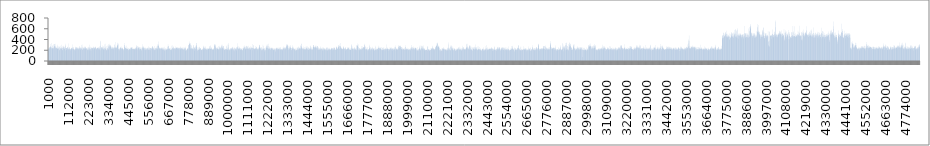
| Category | Series 0 |
|---|---|
| 1000.0 | 235.453 |
| 2000.0 | 217.351 |
| 3000.0 | 222.53 |
| 4000.0 | 208.815 |
| 5000.0 | 203.89 |
| 6000.0 | 242.891 |
| 7000.0 | 251.041 |
| 8000.0 | 257.765 |
| 9000.0 | 253.771 |
| 10000.0 | 222.914 |
| 11000.0 | 248.463 |
| 12000.0 | 273.853 |
| 13000.0 | 261.404 |
| 14000.0 | 249.856 |
| 15000.0 | 253.534 |
| 16000.0 | 316.502 |
| 17000.0 | 277.225 |
| 18000.0 | 334.291 |
| 19000.0 | 245.994 |
| 20000.0 | 260.409 |
| 21000.0 | 244.792 |
| 22000.0 | 225.853 |
| 23000.0 | 235.749 |
| 24000.0 | 282.98 |
| 25000.0 | 288.87 |
| 26000.0 | 235.765 |
| 27000.0 | 233.068 |
| 28000.0 | 240.298 |
| 29000.0 | 249.329 |
| 30000.0 | 245.887 |
| 31000.0 | 240.064 |
| 32000.0 | 222.591 |
| 33000.0 | 308.954 |
| 34000.0 | 316.191 |
| 35000.0 | 317.434 |
| 36000.0 | 312.248 |
| 37000.0 | 269.56 |
| 38000.0 | 275.898 |
| 39000.0 | 279.126 |
| 40000.0 | 322.092 |
| 41000.0 | 247.841 |
| 42000.0 | 270.132 |
| 43000.0 | 234.391 |
| 44000.0 | 255 |
| 45000.0 | 283.317 |
| 46000.0 | 244.268 |
| 47000.0 | 230.388 |
| 48000.0 | 251.718 |
| 49000.0 | 248.49 |
| 50000.0 | 241.421 |
| 51000.0 | 237.573 |
| 52000.0 | 301.914 |
| 53000.0 | 272.368 |
| 54000.0 | 223.002 |
| 55000.0 | 230.593 |
| 56000.0 | 231.656 |
| 57000.0 | 240.941 |
| 58000.0 | 229.871 |
| 59000.0 | 250.768 |
| 60000.0 | 272.821 |
| 61000.0 | 225.849 |
| 62000.0 | 269.092 |
| 63000.0 | 266.373 |
| 64000.0 | 250.383 |
| 65000.0 | 193.726 |
| 66000.0 | 203.237 |
| 67000.0 | 219.23 |
| 68000.0 | 244.583 |
| 69000.0 | 281.864 |
| 70000.0 | 242.761 |
| 71000.0 | 227.646 |
| 72000.0 | 228.386 |
| 73000.0 | 228.784 |
| 74000.0 | 254.205 |
| 75000.0 | 235.844 |
| 76000.0 | 300.545 |
| 77000.0 | 245.462 |
| 78000.0 | 222.706 |
| 79000.0 | 200.399 |
| 80000.0 | 206.49 |
| 81000.0 | 276.136 |
| 82000.0 | 239.4 |
| 83000.0 | 241.327 |
| 84000.0 | 248.958 |
| 85000.0 | 232.288 |
| 86000.0 | 254.1 |
| 87000.0 | 274.466 |
| 88000.0 | 254.657 |
| 89000.0 | 281.837 |
| 90000.0 | 231.65 |
| 91000.0 | 222.845 |
| 92000.0 | 238.022 |
| 93000.0 | 227.869 |
| 94000.0 | 258.39 |
| 95000.0 | 265.739 |
| 96000.0 | 320.007 |
| 97000.0 | 289.093 |
| 98000.0 | 282.306 |
| 99000.0 | 241.098 |
| 100000.0 | 195.601 |
| 101000.0 | 240.187 |
| 102000.0 | 228.827 |
| 103000.0 | 241.585 |
| 104000.0 | 242.284 |
| 105000.0 | 206.944 |
| 106000.0 | 243.322 |
| 107000.0 | 260.981 |
| 108000.0 | 265.699 |
| 109000.0 | 253.62 |
| 110000.0 | 240.399 |
| 111000.0 | 227.457 |
| 112000.0 | 213.309 |
| 113000.0 | 234.737 |
| 114000.0 | 213.098 |
| 115000.0 | 222.211 |
| 116000.0 | 245.713 |
| 117000.0 | 325.523 |
| 118000.0 | 261.906 |
| 119000.0 | 232.667 |
| 120000.0 | 233.776 |
| 121000.0 | 213.194 |
| 122000.0 | 254.122 |
| 123000.0 | 226.416 |
| 124000.0 | 216.545 |
| 125000.0 | 214.791 |
| 126000.0 | 194.188 |
| 127000.0 | 224.928 |
| 128000.0 | 229.505 |
| 129000.0 | 234.472 |
| 130000.0 | 244.07 |
| 131000.0 | 217.762 |
| 132000.0 | 238.69 |
| 133000.0 | 246.879 |
| 134000.0 | 236.827 |
| 135000.0 | 307.251 |
| 136000.0 | 258.978 |
| 137000.0 | 231.313 |
| 138000.0 | 234.789 |
| 139000.0 | 231.331 |
| 140000.0 | 260.905 |
| 141000.0 | 237.59 |
| 142000.0 | 222.281 |
| 143000.0 | 250.682 |
| 144000.0 | 212.742 |
| 145000.0 | 223.014 |
| 146000.0 | 224.497 |
| 147000.0 | 224.547 |
| 148000.0 | 206.563 |
| 149000.0 | 209.379 |
| 150000.0 | 199.551 |
| 151000.0 | 201.843 |
| 152000.0 | 223.871 |
| 153000.0 | 225.843 |
| 154000.0 | 250.496 |
| 155000.0 | 265.269 |
| 156000.0 | 250.664 |
| 157000.0 | 238.338 |
| 158000.0 | 261.592 |
| 159000.0 | 247.09 |
| 160000.0 | 254.499 |
| 161000.0 | 225.21 |
| 162000.0 | 250.606 |
| 163000.0 | 246.779 |
| 164000.0 | 251.504 |
| 165000.0 | 233.049 |
| 166000.0 | 228.346 |
| 167000.0 | 230.76 |
| 168000.0 | 238.335 |
| 169000.0 | 211.24 |
| 170000.0 | 228.68 |
| 171000.0 | 225.02 |
| 172000.0 | 249.262 |
| 173000.0 | 236.714 |
| 174000.0 | 229.157 |
| 175000.0 | 246.19 |
| 176000.0 | 278.343 |
| 177000.0 | 264.26 |
| 178000.0 | 235.489 |
| 179000.0 | 250.348 |
| 180000.0 | 217.307 |
| 181000.0 | 246.123 |
| 182000.0 | 239.303 |
| 183000.0 | 246.079 |
| 184000.0 | 210.015 |
| 185000.0 | 234.298 |
| 186000.0 | 252.045 |
| 187000.0 | 233.265 |
| 188000.0 | 226.039 |
| 189000.0 | 296.796 |
| 190000.0 | 309.068 |
| 191000.0 | 212.438 |
| 192000.0 | 203.067 |
| 193000.0 | 216.535 |
| 194000.0 | 248.136 |
| 195000.0 | 266.014 |
| 196000.0 | 247.428 |
| 197000.0 | 254.209 |
| 198000.0 | 223.549 |
| 199000.0 | 241.81 |
| 200000.0 | 230.371 |
| 201000.0 | 236.367 |
| 202000.0 | 257.486 |
| 203000.0 | 270.732 |
| 204000.0 | 217.448 |
| 205000.0 | 246.72 |
| 206000.0 | 231.829 |
| 207000.0 | 230.49 |
| 208000.0 | 230.772 |
| 209000.0 | 261.635 |
| 210000.0 | 270.134 |
| 211000.0 | 258.379 |
| 212000.0 | 238.624 |
| 213000.0 | 233.26 |
| 214000.0 | 226.807 |
| 215000.0 | 237.684 |
| 216000.0 | 240.857 |
| 217000.0 | 239.132 |
| 218000.0 | 236.943 |
| 219000.0 | 205.144 |
| 220000.0 | 200.427 |
| 221000.0 | 212.011 |
| 222000.0 | 249.422 |
| 223000.0 | 221.109 |
| 224000.0 | 253.863 |
| 225000.0 | 262.827 |
| 226000.0 | 243.963 |
| 227000.0 | 215.483 |
| 228000.0 | 215.87 |
| 229000.0 | 199.265 |
| 230000.0 | 234.978 |
| 231000.0 | 302.05 |
| 232000.0 | 262.575 |
| 233000.0 | 219.703 |
| 234000.0 | 237.17 |
| 235000.0 | 219.518 |
| 236000.0 | 247.626 |
| 237000.0 | 264.159 |
| 238000.0 | 221.27 |
| 239000.0 | 216.78 |
| 240000.0 | 188.529 |
| 241000.0 | 252.029 |
| 242000.0 | 232.394 |
| 243000.0 | 236.974 |
| 244000.0 | 250.407 |
| 245000.0 | 243.202 |
| 246000.0 | 235.988 |
| 247000.0 | 234.776 |
| 248000.0 | 250.89 |
| 249000.0 | 230.658 |
| 250000.0 | 240.942 |
| 251000.0 | 239.683 |
| 252000.0 | 213.704 |
| 253000.0 | 242.193 |
| 254000.0 | 252.358 |
| 255000.0 | 268.891 |
| 256000.0 | 256.751 |
| 257000.0 | 255.645 |
| 258000.0 | 248.687 |
| 259000.0 | 234.362 |
| 260000.0 | 247.65 |
| 261000.0 | 224.568 |
| 262000.0 | 239.821 |
| 263000.0 | 256.784 |
| 264000.0 | 268.901 |
| 265000.0 | 261.6 |
| 266000.0 | 254.279 |
| 267000.0 | 239.802 |
| 268000.0 | 238.03 |
| 269000.0 | 214.094 |
| 270000.0 | 237.916 |
| 271000.0 | 234.855 |
| 272000.0 | 220.56 |
| 273000.0 | 226.816 |
| 274000.0 | 240.705 |
| 275000.0 | 242.881 |
| 276000.0 | 236.616 |
| 277000.0 | 246.69 |
| 278000.0 | 241.133 |
| 279000.0 | 253.779 |
| 280000.0 | 212.048 |
| 281000.0 | 259.075 |
| 282000.0 | 227.103 |
| 283000.0 | 241.135 |
| 284000.0 | 237.76 |
| 285000.0 | 228.887 |
| 286000.0 | 256.758 |
| 287000.0 | 243.376 |
| 288000.0 | 229.673 |
| 289000.0 | 209.819 |
| 290000.0 | 280.609 |
| 291000.0 | 200.851 |
| 292000.0 | 236.074 |
| 293000.0 | 360.88 |
| 294000.0 | 374.773 |
| 295000.0 | 285.117 |
| 296000.0 | 250.018 |
| 297000.0 | 258.831 |
| 298000.0 | 215.283 |
| 299000.0 | 249.315 |
| 300000.0 | 244.003 |
| 301000.0 | 253.827 |
| 302000.0 | 289.294 |
| 303000.0 | 253.083 |
| 304000.0 | 243.57 |
| 305000.0 | 260.362 |
| 306000.0 | 221.814 |
| 307000.0 | 236.732 |
| 308000.0 | 217.783 |
| 309000.0 | 214.938 |
| 310000.0 | 217.841 |
| 311000.0 | 280.336 |
| 312000.0 | 254.199 |
| 313000.0 | 206.183 |
| 314000.0 | 243.14 |
| 315000.0 | 231.11 |
| 316000.0 | 233.556 |
| 317000.0 | 310.12 |
| 318000.0 | 271.974 |
| 319000.0 | 321.979 |
| 320000.0 | 238.097 |
| 321000.0 | 228.269 |
| 322000.0 | 225.379 |
| 323000.0 | 255.908 |
| 324000.0 | 278.368 |
| 325000.0 | 195.708 |
| 326000.0 | 214.611 |
| 327000.0 | 198.961 |
| 328000.0 | 205.024 |
| 329000.0 | 233.833 |
| 330000.0 | 289.404 |
| 331000.0 | 232.075 |
| 332000.0 | 240.764 |
| 333000.0 | 242.293 |
| 334000.0 | 214.743 |
| 335000.0 | 217.958 |
| 336000.0 | 211.774 |
| 337000.0 | 275.013 |
| 338000.0 | 257.015 |
| 339000.0 | 316.438 |
| 340000.0 | 287.124 |
| 341000.0 | 321.689 |
| 342000.0 | 288.837 |
| 343000.0 | 296.044 |
| 344000.0 | 273.574 |
| 345000.0 | 252.29 |
| 346000.0 | 254.254 |
| 347000.0 | 285.861 |
| 348000.0 | 263.115 |
| 349000.0 | 293.165 |
| 350000.0 | 279.032 |
| 351000.0 | 303.678 |
| 352000.0 | 255.698 |
| 353000.0 | 229.89 |
| 354000.0 | 225.678 |
| 355000.0 | 233.952 |
| 356000.0 | 271.41 |
| 357000.0 | 244.356 |
| 358000.0 | 260.494 |
| 359000.0 | 267.096 |
| 360000.0 | 226.675 |
| 361000.0 | 229.546 |
| 362000.0 | 243.985 |
| 363000.0 | 241.318 |
| 364000.0 | 228.532 |
| 365000.0 | 253.191 |
| 366000.0 | 255.34 |
| 367000.0 | 238.182 |
| 368000.0 | 211.713 |
| 369000.0 | 249.074 |
| 370000.0 | 249.281 |
| 371000.0 | 244.79 |
| 372000.0 | 312.607 |
| 373000.0 | 299.88 |
| 374000.0 | 253.122 |
| 375000.0 | 234.786 |
| 376000.0 | 254.46 |
| 377000.0 | 241.911 |
| 378000.0 | 271.996 |
| 379000.0 | 354.196 |
| 380000.0 | 254.656 |
| 381000.0 | 245.046 |
| 382000.0 | 239.295 |
| 383000.0 | 239.718 |
| 384000.0 | 265.282 |
| 385000.0 | 286.355 |
| 386000.0 | 340.356 |
| 387000.0 | 319.87 |
| 388000.0 | 278.834 |
| 389000.0 | 297.427 |
| 390000.0 | 294.899 |
| 391000.0 | 306.291 |
| 392000.0 | 324.827 |
| 393000.0 | 225.433 |
| 394000.0 | 215.839 |
| 395000.0 | 228.646 |
| 396000.0 | 232.201 |
| 397000.0 | 207.064 |
| 398000.0 | 231.089 |
| 399000.0 | 234.815 |
| 400000.0 | 197.539 |
| 401000.0 | 221.338 |
| 402000.0 | 248.182 |
| 403000.0 | 238.401 |
| 404000.0 | 265.056 |
| 405000.0 | 254.596 |
| 406000.0 | 248.799 |
| 407000.0 | 239.648 |
| 408000.0 | 241.981 |
| 409000.0 | 267.471 |
| 410000.0 | 218.673 |
| 411000.0 | 229.753 |
| 412000.0 | 238.315 |
| 413000.0 | 231.925 |
| 414000.0 | 233.534 |
| 415000.0 | 250.109 |
| 416000.0 | 243.917 |
| 417000.0 | 220.999 |
| 418000.0 | 238.766 |
| 419000.0 | 212.358 |
| 420000.0 | 211.386 |
| 421000.0 | 222.371 |
| 422000.0 | 224.788 |
| 423000.0 | 195.163 |
| 424000.0 | 225.618 |
| 425000.0 | 260.255 |
| 426000.0 | 334.054 |
| 427000.0 | 296.621 |
| 428000.0 | 269.499 |
| 429000.0 | 298.933 |
| 430000.0 | 240.485 |
| 431000.0 | 245.722 |
| 432000.0 | 240.094 |
| 433000.0 | 236.686 |
| 434000.0 | 267.564 |
| 435000.0 | 220.877 |
| 436000.0 | 234.651 |
| 437000.0 | 236.86 |
| 438000.0 | 281.451 |
| 439000.0 | 226.19 |
| 440000.0 | 227.444 |
| 441000.0 | 225.135 |
| 442000.0 | 249.502 |
| 443000.0 | 228.804 |
| 444000.0 | 234.4 |
| 445000.0 | 223.732 |
| 446000.0 | 212.731 |
| 447000.0 | 231.48 |
| 448000.0 | 198.997 |
| 449000.0 | 205.843 |
| 450000.0 | 212.526 |
| 451000.0 | 240.788 |
| 452000.0 | 230.979 |
| 453000.0 | 222.936 |
| 454000.0 | 212.769 |
| 455000.0 | 225.754 |
| 456000.0 | 211.386 |
| 457000.0 | 221.333 |
| 458000.0 | 210.966 |
| 459000.0 | 243.452 |
| 460000.0 | 232.461 |
| 461000.0 | 227.656 |
| 462000.0 | 256.883 |
| 463000.0 | 254.565 |
| 464000.0 | 240.47 |
| 465000.0 | 233.34 |
| 466000.0 | 258.161 |
| 467000.0 | 246.428 |
| 468000.0 | 247.854 |
| 469000.0 | 262.211 |
| 470000.0 | 238.95 |
| 471000.0 | 216.285 |
| 472000.0 | 226.522 |
| 473000.0 | 223.218 |
| 474000.0 | 225.061 |
| 475000.0 | 223.335 |
| 476000.0 | 225.393 |
| 477000.0 | 221.247 |
| 478000.0 | 242.556 |
| 479000.0 | 215.393 |
| 480000.0 | 227.591 |
| 481000.0 | 209.921 |
| 482000.0 | 221.048 |
| 483000.0 | 228.597 |
| 484000.0 | 232.757 |
| 485000.0 | 218.51 |
| 486000.0 | 214.656 |
| 487000.0 | 229.236 |
| 488000.0 | 244.017 |
| 489000.0 | 231.464 |
| 490000.0 | 251.875 |
| 491000.0 | 283.731 |
| 492000.0 | 259.191 |
| 493000.0 | 290.797 |
| 494000.0 | 247.199 |
| 495000.0 | 250.938 |
| 496000.0 | 222.141 |
| 497000.0 | 239.344 |
| 498000.0 | 279.773 |
| 499000.0 | 269.744 |
| 500000.0 | 209.923 |
| 501000.0 | 234.823 |
| 502000.0 | 268.651 |
| 503000.0 | 235.236 |
| 504000.0 | 248.888 |
| 505000.0 | 255.242 |
| 506000.0 | 251.738 |
| 507000.0 | 237.588 |
| 508000.0 | 233.634 |
| 509000.0 | 258.45 |
| 510000.0 | 230.233 |
| 511000.0 | 198.319 |
| 512000.0 | 256.727 |
| 513000.0 | 222.742 |
| 514000.0 | 216.855 |
| 515000.0 | 236.581 |
| 516000.0 | 228.103 |
| 517000.0 | 259.202 |
| 518000.0 | 223.846 |
| 519000.0 | 217.964 |
| 520000.0 | 217.252 |
| 521000.0 | 202.284 |
| 522000.0 | 197.026 |
| 523000.0 | 241.688 |
| 524000.0 | 253.796 |
| 525000.0 | 233.385 |
| 526000.0 | 239.745 |
| 527000.0 | 268.654 |
| 528000.0 | 255.123 |
| 529000.0 | 310.877 |
| 530000.0 | 254.353 |
| 531000.0 | 237.378 |
| 532000.0 | 233.153 |
| 533000.0 | 244.742 |
| 534000.0 | 276.684 |
| 535000.0 | 262.971 |
| 536000.0 | 234.094 |
| 537000.0 | 232.566 |
| 538000.0 | 244.864 |
| 539000.0 | 248.125 |
| 540000.0 | 202.566 |
| 541000.0 | 230.83 |
| 542000.0 | 201.391 |
| 543000.0 | 204.962 |
| 544000.0 | 236.738 |
| 545000.0 | 249.516 |
| 546000.0 | 226.721 |
| 547000.0 | 242.738 |
| 548000.0 | 218.111 |
| 549000.0 | 222.274 |
| 550000.0 | 237.431 |
| 551000.0 | 207.832 |
| 552000.0 | 206.09 |
| 553000.0 | 241.373 |
| 554000.0 | 229.6 |
| 555000.0 | 248.005 |
| 556000.0 | 247.852 |
| 557000.0 | 225.582 |
| 558000.0 | 276.608 |
| 559000.0 | 214.274 |
| 560000.0 | 208.659 |
| 561000.0 | 246.31 |
| 562000.0 | 209.186 |
| 563000.0 | 238.646 |
| 564000.0 | 236.599 |
| 565000.0 | 236.476 |
| 566000.0 | 261.852 |
| 567000.0 | 211.267 |
| 568000.0 | 207.147 |
| 569000.0 | 202.018 |
| 570000.0 | 236.095 |
| 571000.0 | 246.756 |
| 572000.0 | 241.423 |
| 573000.0 | 232.255 |
| 574000.0 | 243.498 |
| 575000.0 | 227.046 |
| 576000.0 | 251.177 |
| 577000.0 | 238.907 |
| 578000.0 | 227.037 |
| 579000.0 | 237.496 |
| 580000.0 | 280.955 |
| 581000.0 | 246.221 |
| 582000.0 | 264.961 |
| 583000.0 | 275.13 |
| 584000.0 | 264.075 |
| 585000.0 | 233.054 |
| 586000.0 | 235.105 |
| 587000.0 | 231.032 |
| 588000.0 | 214.612 |
| 589000.0 | 257.014 |
| 590000.0 | 231.827 |
| 591000.0 | 242.666 |
| 592000.0 | 277.436 |
| 593000.0 | 202.517 |
| 594000.0 | 224.942 |
| 595000.0 | 200.596 |
| 596000.0 | 216.098 |
| 597000.0 | 209.96 |
| 598000.0 | 214.59 |
| 599000.0 | 248.546 |
| 600000.0 | 242.332 |
| 601000.0 | 234.062 |
| 602000.0 | 234.964 |
| 603000.0 | 230.906 |
| 604000.0 | 270.643 |
| 605000.0 | 239.049 |
| 606000.0 | 245.69 |
| 607000.0 | 227.886 |
| 608000.0 | 226.78 |
| 609000.0 | 219.822 |
| 610000.0 | 236.486 |
| 611000.0 | 272.777 |
| 612000.0 | 310.776 |
| 613000.0 | 285.379 |
| 614000.0 | 281.915 |
| 615000.0 | 286.808 |
| 616000.0 | 362.546 |
| 617000.0 | 312.894 |
| 618000.0 | 277.465 |
| 619000.0 | 247.197 |
| 620000.0 | 227.265 |
| 621000.0 | 236.254 |
| 622000.0 | 255.822 |
| 623000.0 | 238.002 |
| 624000.0 | 233.028 |
| 625000.0 | 224.627 |
| 626000.0 | 236.678 |
| 627000.0 | 246.68 |
| 628000.0 | 219.155 |
| 629000.0 | 240.82 |
| 630000.0 | 226.209 |
| 631000.0 | 241.629 |
| 632000.0 | 253.95 |
| 633000.0 | 247.197 |
| 634000.0 | 235.393 |
| 635000.0 | 224.983 |
| 636000.0 | 205.655 |
| 637000.0 | 236.663 |
| 638000.0 | 229.034 |
| 639000.0 | 256.752 |
| 640000.0 | 234.113 |
| 641000.0 | 232.783 |
| 642000.0 | 231.142 |
| 643000.0 | 258.032 |
| 644000.0 | 227.855 |
| 645000.0 | 206.892 |
| 646000.0 | 211.88 |
| 647000.0 | 207.262 |
| 648000.0 | 208.799 |
| 649000.0 | 188.344 |
| 650000.0 | 266.152 |
| 651000.0 | 232.321 |
| 652000.0 | 220.649 |
| 653000.0 | 195.302 |
| 654000.0 | 217.629 |
| 655000.0 | 207.611 |
| 656000.0 | 231.269 |
| 657000.0 | 236.473 |
| 658000.0 | 219.375 |
| 659000.0 | 210.535 |
| 660000.0 | 218.863 |
| 661000.0 | 212.826 |
| 662000.0 | 235.692 |
| 663000.0 | 210.179 |
| 664000.0 | 221.793 |
| 665000.0 | 211.809 |
| 666000.0 | 226.389 |
| 667000.0 | 253.578 |
| 668000.0 | 267.732 |
| 669000.0 | 310.33 |
| 670000.0 | 276.739 |
| 671000.0 | 273.374 |
| 672000.0 | 220.982 |
| 673000.0 | 233.2 |
| 674000.0 | 281.143 |
| 675000.0 | 225.259 |
| 676000.0 | 239.631 |
| 677000.0 | 225.899 |
| 678000.0 | 237.285 |
| 679000.0 | 224.439 |
| 680000.0 | 237.665 |
| 681000.0 | 245.676 |
| 682000.0 | 215.132 |
| 683000.0 | 209.042 |
| 684000.0 | 204.436 |
| 685000.0 | 208.079 |
| 686000.0 | 199.507 |
| 687000.0 | 206.076 |
| 688000.0 | 282.659 |
| 689000.0 | 228.57 |
| 690000.0 | 224.047 |
| 691000.0 | 220.624 |
| 692000.0 | 252.093 |
| 693000.0 | 291.688 |
| 694000.0 | 237.222 |
| 695000.0 | 235.836 |
| 696000.0 | 236.574 |
| 697000.0 | 252.438 |
| 698000.0 | 269.932 |
| 699000.0 | 264.128 |
| 700000.0 | 235.872 |
| 701000.0 | 220.359 |
| 702000.0 | 231.298 |
| 703000.0 | 229.311 |
| 704000.0 | 243.461 |
| 705000.0 | 237.602 |
| 706000.0 | 230.725 |
| 707000.0 | 233.298 |
| 708000.0 | 214.178 |
| 709000.0 | 240.667 |
| 710000.0 | 232.927 |
| 711000.0 | 218.28 |
| 712000.0 | 269.843 |
| 713000.0 | 237.157 |
| 714000.0 | 246.992 |
| 715000.0 | 255.808 |
| 716000.0 | 242.956 |
| 717000.0 | 250.694 |
| 718000.0 | 240.344 |
| 719000.0 | 247.819 |
| 720000.0 | 225.274 |
| 721000.0 | 250.15 |
| 722000.0 | 240.256 |
| 723000.0 | 255.868 |
| 724000.0 | 235.505 |
| 725000.0 | 244.22 |
| 726000.0 | 225.59 |
| 727000.0 | 213.091 |
| 728000.0 | 246.995 |
| 729000.0 | 234.908 |
| 730000.0 | 247.971 |
| 731000.0 | 242.781 |
| 732000.0 | 214.275 |
| 733000.0 | 250.563 |
| 734000.0 | 233.983 |
| 735000.0 | 240.016 |
| 736000.0 | 236.221 |
| 737000.0 | 214.21 |
| 738000.0 | 268.389 |
| 739000.0 | 249.857 |
| 740000.0 | 224.354 |
| 741000.0 | 246.301 |
| 742000.0 | 229.181 |
| 743000.0 | 238.312 |
| 744000.0 | 232.053 |
| 745000.0 | 249.548 |
| 746000.0 | 244.106 |
| 747000.0 | 210.657 |
| 748000.0 | 238.913 |
| 749000.0 | 230.195 |
| 750000.0 | 253.532 |
| 751000.0 | 237.926 |
| 752000.0 | 224.361 |
| 753000.0 | 220.942 |
| 754000.0 | 204.786 |
| 755000.0 | 209.918 |
| 756000.0 | 221.796 |
| 757000.0 | 245.682 |
| 758000.0 | 256.482 |
| 759000.0 | 211.965 |
| 760000.0 | 232.018 |
| 761000.0 | 222.017 |
| 762000.0 | 250.42 |
| 763000.0 | 242.254 |
| 764000.0 | 241.118 |
| 765000.0 | 226.502 |
| 766000.0 | 264.037 |
| 767000.0 | 247.557 |
| 768000.0 | 215.652 |
| 769000.0 | 186.66 |
| 770000.0 | 203.806 |
| 771000.0 | 207.967 |
| 772000.0 | 198.534 |
| 773000.0 | 194.92 |
| 774000.0 | 217.078 |
| 775000.0 | 241.621 |
| 776000.0 | 219.797 |
| 777000.0 | 222.326 |
| 778000.0 | 243.243 |
| 779000.0 | 223.727 |
| 780000.0 | 225.759 |
| 781000.0 | 215.551 |
| 782000.0 | 290.871 |
| 783000.0 | 292.468 |
| 784000.0 | 245.285 |
| 785000.0 | 299.662 |
| 786000.0 | 320.127 |
| 787000.0 | 326.255 |
| 788000.0 | 312.965 |
| 789000.0 | 318.603 |
| 790000.0 | 330.866 |
| 791000.0 | 363.394 |
| 792000.0 | 327.652 |
| 793000.0 | 328.542 |
| 794000.0 | 298.549 |
| 795000.0 | 251.806 |
| 796000.0 | 223.326 |
| 797000.0 | 236.256 |
| 798000.0 | 289.489 |
| 799000.0 | 243.817 |
| 800000.0 | 223.362 |
| 801000.0 | 235.574 |
| 802000.0 | 289.781 |
| 803000.0 | 233.308 |
| 804000.0 | 219.323 |
| 805000.0 | 244.829 |
| 806000.0 | 248.405 |
| 807000.0 | 221.73 |
| 808000.0 | 229.983 |
| 809000.0 | 299.971 |
| 810000.0 | 293.055 |
| 811000.0 | 229.617 |
| 812000.0 | 214.443 |
| 813000.0 | 267.144 |
| 814000.0 | 251.969 |
| 815000.0 | 239.08 |
| 816000.0 | 196.779 |
| 817000.0 | 225.694 |
| 818000.0 | 256.7 |
| 819000.0 | 247.359 |
| 820000.0 | 281.684 |
| 821000.0 | 245.904 |
| 822000.0 | 224.071 |
| 823000.0 | 217.568 |
| 824000.0 | 265.633 |
| 825000.0 | 252.984 |
| 826000.0 | 269.052 |
| 827000.0 | 336.53 |
| 828000.0 | 336.714 |
| 829000.0 | 293.152 |
| 830000.0 | 291.403 |
| 831000.0 | 208.54 |
| 832000.0 | 199.875 |
| 833000.0 | 187.064 |
| 834000.0 | 223.107 |
| 835000.0 | 256.861 |
| 836000.0 | 205.213 |
| 837000.0 | 230.443 |
| 838000.0 | 254.468 |
| 839000.0 | 218.96 |
| 840000.0 | 204.058 |
| 841000.0 | 203.966 |
| 842000.0 | 251.917 |
| 843000.0 | 264.17 |
| 844000.0 | 222.392 |
| 845000.0 | 208.62 |
| 846000.0 | 251.982 |
| 847000.0 | 216.345 |
| 848000.0 | 218.289 |
| 849000.0 | 238.995 |
| 850000.0 | 243.283 |
| 851000.0 | 242.791 |
| 852000.0 | 232.157 |
| 853000.0 | 211.408 |
| 854000.0 | 200.204 |
| 855000.0 | 222.957 |
| 856000.0 | 204.481 |
| 857000.0 | 208.103 |
| 858000.0 | 202.529 |
| 859000.0 | 222.648 |
| 860000.0 | 224.71 |
| 861000.0 | 232.166 |
| 862000.0 | 211.522 |
| 863000.0 | 205.012 |
| 864000.0 | 226.187 |
| 865000.0 | 250.441 |
| 866000.0 | 214.575 |
| 867000.0 | 269.141 |
| 868000.0 | 285.768 |
| 869000.0 | 249.413 |
| 870000.0 | 255.073 |
| 871000.0 | 241.188 |
| 872000.0 | 238.344 |
| 873000.0 | 214.277 |
| 874000.0 | 233.69 |
| 875000.0 | 272.246 |
| 876000.0 | 263.7 |
| 877000.0 | 229.101 |
| 878000.0 | 217.963 |
| 879000.0 | 221.942 |
| 880000.0 | 243.134 |
| 881000.0 | 230.248 |
| 882000.0 | 212.035 |
| 883000.0 | 214.053 |
| 884000.0 | 210.811 |
| 885000.0 | 217.91 |
| 886000.0 | 235.682 |
| 887000.0 | 208.679 |
| 888000.0 | 226.239 |
| 889000.0 | 212.338 |
| 890000.0 | 228.201 |
| 891000.0 | 242.402 |
| 892000.0 | 231.274 |
| 893000.0 | 223.087 |
| 894000.0 | 226.941 |
| 895000.0 | 220.519 |
| 896000.0 | 226.686 |
| 897000.0 | 233.728 |
| 898000.0 | 277.304 |
| 899000.0 | 239.385 |
| 900000.0 | 266.266 |
| 901000.0 | 233.311 |
| 902000.0 | 229.525 |
| 903000.0 | 227.597 |
| 904000.0 | 223.682 |
| 905000.0 | 236.786 |
| 906000.0 | 223.454 |
| 907000.0 | 276.572 |
| 908000.0 | 295.157 |
| 909000.0 | 248.913 |
| 910000.0 | 218.07 |
| 911000.0 | 253.484 |
| 912000.0 | 243.141 |
| 913000.0 | 228.869 |
| 914000.0 | 224.291 |
| 915000.0 | 227.224 |
| 916000.0 | 218.833 |
| 917000.0 | 211.536 |
| 918000.0 | 208.522 |
| 919000.0 | 211.506 |
| 920000.0 | 215.803 |
| 921000.0 | 226.228 |
| 922000.0 | 212.93 |
| 923000.0 | 223.826 |
| 924000.0 | 207.952 |
| 925000.0 | 239.929 |
| 926000.0 | 286.819 |
| 927000.0 | 318.576 |
| 928000.0 | 313.848 |
| 929000.0 | 278.588 |
| 930000.0 | 297.896 |
| 931000.0 | 301.092 |
| 932000.0 | 263.594 |
| 933000.0 | 306.001 |
| 934000.0 | 284.971 |
| 935000.0 | 225.869 |
| 936000.0 | 252.713 |
| 937000.0 | 244.163 |
| 938000.0 | 251.283 |
| 939000.0 | 227.365 |
| 940000.0 | 207.4 |
| 941000.0 | 235.219 |
| 942000.0 | 235.002 |
| 943000.0 | 235.525 |
| 944000.0 | 223.993 |
| 945000.0 | 259.441 |
| 946000.0 | 231.842 |
| 947000.0 | 229.429 |
| 948000.0 | 227.54 |
| 949000.0 | 279.199 |
| 950000.0 | 225.426 |
| 951000.0 | 211.155 |
| 952000.0 | 218.12 |
| 953000.0 | 211.294 |
| 954000.0 | 224.189 |
| 955000.0 | 283.842 |
| 956000.0 | 258.566 |
| 957000.0 | 244.418 |
| 958000.0 | 250.949 |
| 959000.0 | 252.147 |
| 960000.0 | 237.313 |
| 961000.0 | 218.484 |
| 962000.0 | 238.625 |
| 963000.0 | 248.217 |
| 964000.0 | 266.749 |
| 965000.0 | 250.103 |
| 966000.0 | 228.635 |
| 967000.0 | 275.499 |
| 968000.0 | 303.85 |
| 969000.0 | 283.356 |
| 970000.0 | 280.208 |
| 971000.0 | 244.484 |
| 972000.0 | 249.136 |
| 973000.0 | 247.808 |
| 974000.0 | 228.378 |
| 975000.0 | 301.116 |
| 976000.0 | 281.215 |
| 977000.0 | 281.238 |
| 978000.0 | 223.33 |
| 979000.0 | 271.287 |
| 980000.0 | 235.113 |
| 981000.0 | 214.723 |
| 982000.0 | 215.904 |
| 983000.0 | 206.901 |
| 984000.0 | 216.019 |
| 985000.0 | 214.327 |
| 986000.0 | 241.07 |
| 987000.0 | 228.765 |
| 988000.0 | 229.121 |
| 989000.0 | 223.227 |
| 990000.0 | 213.11 |
| 991000.0 | 212.794 |
| 992000.0 | 215.352 |
| 993000.0 | 282.655 |
| 994000.0 | 216.839 |
| 995000.0 | 214.626 |
| 996000.0 | 269.928 |
| 997000.0 | 224.053 |
| 998000.0 | 212.447 |
| 999000.0 | 238.999 |
| 1000000.0 | 207.787 |
| 1001000.0 | 210.105 |
| 1002000.0 | 244.727 |
| 1003000.0 | 308.163 |
| 1004000.0 | 302.784 |
| 1005000.0 | 335.175 |
| 1006000.0 | 253.839 |
| 1007000.0 | 210.376 |
| 1008000.0 | 226.899 |
| 1009000.0 | 207.597 |
| 1010000.0 | 191.596 |
| 1011000.0 | 208.347 |
| 1012000.0 | 217.296 |
| 1013000.0 | 228.812 |
| 1014000.0 | 208.393 |
| 1015000.0 | 237.045 |
| 1016000.0 | 230.246 |
| 1017000.0 | 214.952 |
| 1018000.0 | 215.069 |
| 1019000.0 | 238.481 |
| 1020000.0 | 226.675 |
| 1021000.0 | 217.209 |
| 1022000.0 | 244.471 |
| 1023000.0 | 241.272 |
| 1024000.0 | 213.596 |
| 1025000.0 | 235.238 |
| 1026000.0 | 249.672 |
| 1027000.0 | 249.604 |
| 1028000.0 | 263.946 |
| 1029000.0 | 237.571 |
| 1030000.0 | 220.032 |
| 1031000.0 | 251.033 |
| 1032000.0 | 221.347 |
| 1033000.0 | 199.067 |
| 1034000.0 | 223.443 |
| 1035000.0 | 211.584 |
| 1036000.0 | 237.152 |
| 1037000.0 | 254.908 |
| 1038000.0 | 242.79 |
| 1039000.0 | 202.778 |
| 1040000.0 | 179.934 |
| 1041000.0 | 228.109 |
| 1042000.0 | 238.926 |
| 1043000.0 | 208.942 |
| 1044000.0 | 224.716 |
| 1045000.0 | 232.81 |
| 1046000.0 | 233.921 |
| 1047000.0 | 229.264 |
| 1048000.0 | 215.695 |
| 1049000.0 | 193.401 |
| 1050000.0 | 223.241 |
| 1051000.0 | 242.091 |
| 1052000.0 | 249.271 |
| 1053000.0 | 259.568 |
| 1054000.0 | 261.255 |
| 1055000.0 | 329.992 |
| 1056000.0 | 272.272 |
| 1057000.0 | 236.187 |
| 1058000.0 | 251.687 |
| 1059000.0 | 274.2 |
| 1060000.0 | 240.338 |
| 1061000.0 | 215.126 |
| 1062000.0 | 222.826 |
| 1063000.0 | 223.555 |
| 1064000.0 | 237.732 |
| 1065000.0 | 251.189 |
| 1066000.0 | 237.783 |
| 1067000.0 | 239.113 |
| 1068000.0 | 263.347 |
| 1069000.0 | 227.008 |
| 1070000.0 | 226.746 |
| 1071000.0 | 236.438 |
| 1072000.0 | 239.741 |
| 1073000.0 | 207.099 |
| 1074000.0 | 203.689 |
| 1075000.0 | 218.266 |
| 1076000.0 | 228.766 |
| 1077000.0 | 218.514 |
| 1078000.0 | 212.624 |
| 1079000.0 | 210.573 |
| 1080000.0 | 236.244 |
| 1081000.0 | 220.475 |
| 1082000.0 | 210.093 |
| 1083000.0 | 208.105 |
| 1084000.0 | 201.767 |
| 1085000.0 | 239.93 |
| 1086000.0 | 193.444 |
| 1087000.0 | 230.448 |
| 1088000.0 | 233.156 |
| 1089000.0 | 227.162 |
| 1090000.0 | 238.084 |
| 1091000.0 | 245.307 |
| 1092000.0 | 270.741 |
| 1093000.0 | 235.687 |
| 1094000.0 | 253.367 |
| 1095000.0 | 259.227 |
| 1096000.0 | 289.632 |
| 1097000.0 | 265.654 |
| 1098000.0 | 218.039 |
| 1099000.0 | 271.808 |
| 1100000.0 | 246.032 |
| 1101000.0 | 247.773 |
| 1102000.0 | 224.549 |
| 1103000.0 | 220.23 |
| 1104000.0 | 229.6 |
| 1105000.0 | 269.541 |
| 1106000.0 | 284.131 |
| 1107000.0 | 280.154 |
| 1108000.0 | 231.371 |
| 1109000.0 | 266.423 |
| 1110000.0 | 280.097 |
| 1111000.0 | 231.804 |
| 1112000.0 | 223.492 |
| 1113000.0 | 245.533 |
| 1114000.0 | 258.676 |
| 1115000.0 | 285.636 |
| 1116000.0 | 212.668 |
| 1117000.0 | 237.033 |
| 1118000.0 | 235.856 |
| 1119000.0 | 225.825 |
| 1120000.0 | 234.039 |
| 1121000.0 | 215.552 |
| 1122000.0 | 246.988 |
| 1123000.0 | 256.004 |
| 1124000.0 | 238.608 |
| 1125000.0 | 247.017 |
| 1126000.0 | 248.664 |
| 1127000.0 | 215.902 |
| 1128000.0 | 219.136 |
| 1129000.0 | 212.5 |
| 1130000.0 | 242.033 |
| 1131000.0 | 274.674 |
| 1132000.0 | 248.08 |
| 1133000.0 | 248.735 |
| 1134000.0 | 246.04 |
| 1135000.0 | 233.196 |
| 1136000.0 | 266.977 |
| 1137000.0 | 247.443 |
| 1138000.0 | 199.908 |
| 1139000.0 | 241.413 |
| 1140000.0 | 245.597 |
| 1141000.0 | 315.407 |
| 1142000.0 | 235.598 |
| 1143000.0 | 297.567 |
| 1144000.0 | 289.297 |
| 1145000.0 | 235.202 |
| 1146000.0 | 223.542 |
| 1147000.0 | 242.658 |
| 1148000.0 | 234.031 |
| 1149000.0 | 229.968 |
| 1150000.0 | 214.764 |
| 1151000.0 | 224.2 |
| 1152000.0 | 227.959 |
| 1153000.0 | 232.816 |
| 1154000.0 | 235.951 |
| 1155000.0 | 219.262 |
| 1156000.0 | 233.078 |
| 1157000.0 | 239.306 |
| 1158000.0 | 279.34 |
| 1159000.0 | 237.644 |
| 1160000.0 | 225.043 |
| 1161000.0 | 266.116 |
| 1162000.0 | 244.794 |
| 1163000.0 | 259.593 |
| 1164000.0 | 251.455 |
| 1165000.0 | 227.925 |
| 1166000.0 | 232.534 |
| 1167000.0 | 223.616 |
| 1168000.0 | 201.694 |
| 1169000.0 | 230.707 |
| 1170000.0 | 217.685 |
| 1171000.0 | 234.281 |
| 1172000.0 | 208.674 |
| 1173000.0 | 225.809 |
| 1174000.0 | 228.148 |
| 1175000.0 | 249.761 |
| 1176000.0 | 275.086 |
| 1177000.0 | 299.721 |
| 1178000.0 | 303.435 |
| 1179000.0 | 261.088 |
| 1180000.0 | 243.753 |
| 1181000.0 | 291.227 |
| 1182000.0 | 238.173 |
| 1183000.0 | 242.989 |
| 1184000.0 | 226.235 |
| 1185000.0 | 261.846 |
| 1186000.0 | 232.592 |
| 1187000.0 | 214.113 |
| 1188000.0 | 250.296 |
| 1189000.0 | 260.336 |
| 1190000.0 | 197.898 |
| 1191000.0 | 202.294 |
| 1192000.0 | 230.67 |
| 1193000.0 | 217.938 |
| 1194000.0 | 200.446 |
| 1195000.0 | 229.297 |
| 1196000.0 | 209.631 |
| 1197000.0 | 238.545 |
| 1198000.0 | 302.269 |
| 1199000.0 | 279.232 |
| 1200000.0 | 238.606 |
| 1201000.0 | 225.111 |
| 1202000.0 | 220.385 |
| 1203000.0 | 230.924 |
| 1204000.0 | 210.058 |
| 1205000.0 | 218.343 |
| 1206000.0 | 241.208 |
| 1207000.0 | 239.272 |
| 1208000.0 | 201.374 |
| 1209000.0 | 178.904 |
| 1210000.0 | 197.894 |
| 1211000.0 | 208.496 |
| 1212000.0 | 228.96 |
| 1213000.0 | 199.204 |
| 1214000.0 | 251.237 |
| 1215000.0 | 247.795 |
| 1216000.0 | 241.84 |
| 1217000.0 | 274.583 |
| 1218000.0 | 256.249 |
| 1219000.0 | 279.341 |
| 1220000.0 | 303.695 |
| 1221000.0 | 289.212 |
| 1222000.0 | 313.307 |
| 1223000.0 | 248.301 |
| 1224000.0 | 243.314 |
| 1225000.0 | 275.131 |
| 1226000.0 | 212.538 |
| 1227000.0 | 229.836 |
| 1228000.0 | 227.913 |
| 1229000.0 | 235.121 |
| 1230000.0 | 278.76 |
| 1231000.0 | 321.842 |
| 1232000.0 | 263.421 |
| 1233000.0 | 239.845 |
| 1234000.0 | 221.888 |
| 1235000.0 | 224.587 |
| 1236000.0 | 238.713 |
| 1237000.0 | 265.854 |
| 1238000.0 | 232.721 |
| 1239000.0 | 210.512 |
| 1240000.0 | 209.402 |
| 1241000.0 | 242.232 |
| 1242000.0 | 230.252 |
| 1243000.0 | 232.534 |
| 1244000.0 | 238.078 |
| 1245000.0 | 227.373 |
| 1246000.0 | 236.39 |
| 1247000.0 | 248.812 |
| 1248000.0 | 252.205 |
| 1249000.0 | 237.939 |
| 1250000.0 | 239.47 |
| 1251000.0 | 245.081 |
| 1252000.0 | 216.951 |
| 1253000.0 | 217.026 |
| 1254000.0 | 207.84 |
| 1255000.0 | 204.062 |
| 1256000.0 | 214.883 |
| 1257000.0 | 201.73 |
| 1258000.0 | 230.257 |
| 1259000.0 | 231.705 |
| 1260000.0 | 235.336 |
| 1261000.0 | 230.278 |
| 1262000.0 | 216.108 |
| 1263000.0 | 220.395 |
| 1264000.0 | 209.802 |
| 1265000.0 | 200.645 |
| 1266000.0 | 221.16 |
| 1267000.0 | 240.774 |
| 1268000.0 | 222.426 |
| 1269000.0 | 197.754 |
| 1270000.0 | 173.944 |
| 1271000.0 | 224.684 |
| 1272000.0 | 236.339 |
| 1273000.0 | 237.978 |
| 1274000.0 | 242.218 |
| 1275000.0 | 235.642 |
| 1276000.0 | 258.173 |
| 1277000.0 | 238.17 |
| 1278000.0 | 221.073 |
| 1279000.0 | 204.86 |
| 1280000.0 | 227.584 |
| 1281000.0 | 239.907 |
| 1282000.0 | 230.597 |
| 1283000.0 | 225.437 |
| 1284000.0 | 222.485 |
| 1285000.0 | 209.103 |
| 1286000.0 | 227.043 |
| 1287000.0 | 252.325 |
| 1288000.0 | 221.296 |
| 1289000.0 | 236.029 |
| 1290000.0 | 239.395 |
| 1291000.0 | 256.802 |
| 1292000.0 | 211.126 |
| 1293000.0 | 211.031 |
| 1294000.0 | 229.289 |
| 1295000.0 | 249.192 |
| 1296000.0 | 206.92 |
| 1297000.0 | 223.844 |
| 1298000.0 | 257.967 |
| 1299000.0 | 229.399 |
| 1300000.0 | 212.879 |
| 1301000.0 | 220.937 |
| 1302000.0 | 206.509 |
| 1303000.0 | 224.587 |
| 1304000.0 | 203.46 |
| 1305000.0 | 201.245 |
| 1306000.0 | 222.078 |
| 1307000.0 | 216.793 |
| 1308000.0 | 218.138 |
| 1309000.0 | 247.627 |
| 1310000.0 | 251.345 |
| 1311000.0 | 271.692 |
| 1312000.0 | 239.202 |
| 1313000.0 | 234.64 |
| 1314000.0 | 238.394 |
| 1315000.0 | 222.33 |
| 1316000.0 | 252.734 |
| 1317000.0 | 213.254 |
| 1318000.0 | 232.465 |
| 1319000.0 | 242.021 |
| 1320000.0 | 255.296 |
| 1321000.0 | 235.484 |
| 1322000.0 | 232.841 |
| 1323000.0 | 233.119 |
| 1324000.0 | 217.443 |
| 1325000.0 | 259 |
| 1326000.0 | 247.441 |
| 1327000.0 | 299.129 |
| 1328000.0 | 315.259 |
| 1329000.0 | 270.243 |
| 1330000.0 | 284.542 |
| 1331000.0 | 268.637 |
| 1332000.0 | 305.555 |
| 1333000.0 | 284.641 |
| 1334000.0 | 296.251 |
| 1335000.0 | 306.365 |
| 1336000.0 | 285.449 |
| 1337000.0 | 252.896 |
| 1338000.0 | 246.851 |
| 1339000.0 | 285.915 |
| 1340000.0 | 242.199 |
| 1341000.0 | 216.396 |
| 1342000.0 | 209.004 |
| 1343000.0 | 223.187 |
| 1344000.0 | 219.997 |
| 1345000.0 | 240.549 |
| 1346000.0 | 249.441 |
| 1347000.0 | 254.275 |
| 1348000.0 | 284.901 |
| 1349000.0 | 272.97 |
| 1350000.0 | 296.232 |
| 1351000.0 | 244.715 |
| 1352000.0 | 255.067 |
| 1353000.0 | 249.797 |
| 1354000.0 | 241.077 |
| 1355000.0 | 241.669 |
| 1356000.0 | 205.426 |
| 1357000.0 | 198.331 |
| 1358000.0 | 218.476 |
| 1359000.0 | 242.924 |
| 1360000.0 | 292.668 |
| 1361000.0 | 254.028 |
| 1362000.0 | 234.985 |
| 1363000.0 | 236.05 |
| 1364000.0 | 223.003 |
| 1365000.0 | 263.012 |
| 1366000.0 | 243.983 |
| 1367000.0 | 225.212 |
| 1368000.0 | 219.704 |
| 1369000.0 | 264.857 |
| 1370000.0 | 241.749 |
| 1371000.0 | 219.897 |
| 1372000.0 | 216.303 |
| 1373000.0 | 227.112 |
| 1374000.0 | 210.744 |
| 1375000.0 | 231.278 |
| 1376000.0 | 220.606 |
| 1377000.0 | 189.057 |
| 1378000.0 | 219.941 |
| 1379000.0 | 193.211 |
| 1380000.0 | 207.75 |
| 1381000.0 | 237.276 |
| 1382000.0 | 245.649 |
| 1383000.0 | 212.147 |
| 1384000.0 | 205.781 |
| 1385000.0 | 194.824 |
| 1386000.0 | 213.822 |
| 1387000.0 | 204.863 |
| 1388000.0 | 212.108 |
| 1389000.0 | 246.919 |
| 1390000.0 | 209.658 |
| 1391000.0 | 239.448 |
| 1392000.0 | 252.573 |
| 1393000.0 | 247.878 |
| 1394000.0 | 230.09 |
| 1395000.0 | 271.816 |
| 1396000.0 | 254.79 |
| 1397000.0 | 209.882 |
| 1398000.0 | 218.654 |
| 1399000.0 | 239.534 |
| 1400000.0 | 232.773 |
| 1401000.0 | 223.937 |
| 1402000.0 | 253.08 |
| 1403000.0 | 235.84 |
| 1404000.0 | 245.62 |
| 1405000.0 | 226.569 |
| 1406000.0 | 217.042 |
| 1407000.0 | 282.316 |
| 1408000.0 | 243.631 |
| 1409000.0 | 289.62 |
| 1410000.0 | 271.661 |
| 1411000.0 | 323.093 |
| 1412000.0 | 318.807 |
| 1413000.0 | 252.551 |
| 1414000.0 | 239.148 |
| 1415000.0 | 273.095 |
| 1416000.0 | 247.224 |
| 1417000.0 | 223.596 |
| 1418000.0 | 218.059 |
| 1419000.0 | 246.922 |
| 1420000.0 | 231.747 |
| 1421000.0 | 223.201 |
| 1422000.0 | 209.404 |
| 1423000.0 | 270.096 |
| 1424000.0 | 231.397 |
| 1425000.0 | 226.164 |
| 1426000.0 | 242.408 |
| 1427000.0 | 229.527 |
| 1428000.0 | 261.834 |
| 1429000.0 | 227.253 |
| 1430000.0 | 210.356 |
| 1431000.0 | 218.225 |
| 1432000.0 | 219.913 |
| 1433000.0 | 224.218 |
| 1434000.0 | 208.563 |
| 1435000.0 | 212.657 |
| 1436000.0 | 233.655 |
| 1437000.0 | 266.836 |
| 1438000.0 | 239.827 |
| 1439000.0 | 233.856 |
| 1440000.0 | 251.679 |
| 1441000.0 | 229.093 |
| 1442000.0 | 249.694 |
| 1443000.0 | 277.911 |
| 1444000.0 | 245.162 |
| 1445000.0 | 269.243 |
| 1446000.0 | 218.046 |
| 1447000.0 | 228.28 |
| 1448000.0 | 212.312 |
| 1449000.0 | 215.861 |
| 1450000.0 | 207.171 |
| 1451000.0 | 242.38 |
| 1452000.0 | 255.861 |
| 1453000.0 | 250.354 |
| 1454000.0 | 204.344 |
| 1455000.0 | 238.739 |
| 1456000.0 | 233.943 |
| 1457000.0 | 215.556 |
| 1458000.0 | 225.73 |
| 1459000.0 | 225.071 |
| 1460000.0 | 282.411 |
| 1461000.0 | 219.988 |
| 1462000.0 | 246.607 |
| 1463000.0 | 219.285 |
| 1464000.0 | 251.166 |
| 1465000.0 | 284.092 |
| 1466000.0 | 254.396 |
| 1467000.0 | 248.57 |
| 1468000.0 | 205.246 |
| 1469000.0 | 218.36 |
| 1470000.0 | 216.941 |
| 1471000.0 | 220.13 |
| 1472000.0 | 225.615 |
| 1473000.0 | 213.708 |
| 1474000.0 | 208.997 |
| 1475000.0 | 213.001 |
| 1476000.0 | 250.287 |
| 1477000.0 | 291.88 |
| 1478000.0 | 260.751 |
| 1479000.0 | 263.778 |
| 1480000.0 | 299.164 |
| 1481000.0 | 297.569 |
| 1482000.0 | 263.044 |
| 1483000.0 | 255.176 |
| 1484000.0 | 270.472 |
| 1485000.0 | 246.121 |
| 1486000.0 | 237.214 |
| 1487000.0 | 261.924 |
| 1488000.0 | 260.961 |
| 1489000.0 | 246.994 |
| 1490000.0 | 272.509 |
| 1491000.0 | 290.677 |
| 1492000.0 | 270.565 |
| 1493000.0 | 251.087 |
| 1494000.0 | 283.808 |
| 1495000.0 | 248.418 |
| 1496000.0 | 250.736 |
| 1497000.0 | 234.735 |
| 1498000.0 | 256.634 |
| 1499000.0 | 263.994 |
| 1500000.0 | 275.797 |
| 1501000.0 | 280.359 |
| 1502000.0 | 279.313 |
| 1503000.0 | 214.134 |
| 1504000.0 | 242.656 |
| 1505000.0 | 244.543 |
| 1506000.0 | 255.952 |
| 1507000.0 | 206.542 |
| 1508000.0 | 212.7 |
| 1509000.0 | 227.803 |
| 1510000.0 | 231.142 |
| 1511000.0 | 218.581 |
| 1512000.0 | 239.227 |
| 1513000.0 | 215.426 |
| 1514000.0 | 205.205 |
| 1515000.0 | 230.298 |
| 1516000.0 | 220.261 |
| 1517000.0 | 216.547 |
| 1518000.0 | 213.645 |
| 1519000.0 | 241.354 |
| 1520000.0 | 271.887 |
| 1521000.0 | 250.583 |
| 1522000.0 | 215.376 |
| 1523000.0 | 234.383 |
| 1524000.0 | 227.238 |
| 1525000.0 | 238.931 |
| 1526000.0 | 226.006 |
| 1527000.0 | 228.237 |
| 1528000.0 | 234.299 |
| 1529000.0 | 258 |
| 1530000.0 | 208.437 |
| 1531000.0 | 211.693 |
| 1532000.0 | 192.898 |
| 1533000.0 | 199.792 |
| 1534000.0 | 216.495 |
| 1535000.0 | 235.824 |
| 1536000.0 | 257.45 |
| 1537000.0 | 239.192 |
| 1538000.0 | 219.76 |
| 1539000.0 | 238.007 |
| 1540000.0 | 211.427 |
| 1541000.0 | 229.356 |
| 1542000.0 | 212.768 |
| 1543000.0 | 235.233 |
| 1544000.0 | 214.794 |
| 1545000.0 | 212.169 |
| 1546000.0 | 220.721 |
| 1547000.0 | 210.161 |
| 1548000.0 | 231.624 |
| 1549000.0 | 197.083 |
| 1550000.0 | 237.952 |
| 1551000.0 | 259.192 |
| 1552000.0 | 243.392 |
| 1553000.0 | 233.528 |
| 1554000.0 | 203.201 |
| 1555000.0 | 199.431 |
| 1556000.0 | 249.885 |
| 1557000.0 | 197.579 |
| 1558000.0 | 211.355 |
| 1559000.0 | 234.058 |
| 1560000.0 | 250.458 |
| 1561000.0 | 224.113 |
| 1562000.0 | 216.599 |
| 1563000.0 | 244.16 |
| 1564000.0 | 215.425 |
| 1565000.0 | 206.28 |
| 1566000.0 | 222.271 |
| 1567000.0 | 247.135 |
| 1568000.0 | 199.354 |
| 1569000.0 | 215.409 |
| 1570000.0 | 220.424 |
| 1571000.0 | 230.91 |
| 1572000.0 | 228.502 |
| 1573000.0 | 219.105 |
| 1574000.0 | 204.219 |
| 1575000.0 | 213.635 |
| 1576000.0 | 209.754 |
| 1577000.0 | 225.188 |
| 1578000.0 | 234.555 |
| 1579000.0 | 216.938 |
| 1580000.0 | 240.237 |
| 1581000.0 | 245.489 |
| 1582000.0 | 236.547 |
| 1583000.0 | 243.851 |
| 1584000.0 | 233.932 |
| 1585000.0 | 243.237 |
| 1586000.0 | 222.09 |
| 1587000.0 | 200.634 |
| 1588000.0 | 211.402 |
| 1589000.0 | 230.603 |
| 1590000.0 | 234.324 |
| 1591000.0 | 204.601 |
| 1592000.0 | 234.588 |
| 1593000.0 | 257.193 |
| 1594000.0 | 249.564 |
| 1595000.0 | 250.189 |
| 1596000.0 | 238.281 |
| 1597000.0 | 209.757 |
| 1598000.0 | 241.217 |
| 1599000.0 | 235.041 |
| 1600000.0 | 213.261 |
| 1601000.0 | 214.422 |
| 1602000.0 | 207.924 |
| 1603000.0 | 202.947 |
| 1604000.0 | 215.078 |
| 1605000.0 | 257.817 |
| 1606000.0 | 257.858 |
| 1607000.0 | 274.307 |
| 1608000.0 | 262.042 |
| 1609000.0 | 215.871 |
| 1610000.0 | 240.181 |
| 1611000.0 | 221.038 |
| 1612000.0 | 228.572 |
| 1613000.0 | 242.125 |
| 1614000.0 | 221.504 |
| 1615000.0 | 249.751 |
| 1616000.0 | 297.292 |
| 1617000.0 | 263.117 |
| 1618000.0 | 250.721 |
| 1619000.0 | 254.406 |
| 1620000.0 | 272.981 |
| 1621000.0 | 293.045 |
| 1622000.0 | 280.626 |
| 1623000.0 | 227.485 |
| 1624000.0 | 226.9 |
| 1625000.0 | 279.608 |
| 1626000.0 | 305.337 |
| 1627000.0 | 266.367 |
| 1628000.0 | 273.25 |
| 1629000.0 | 275.83 |
| 1630000.0 | 239.673 |
| 1631000.0 | 269.415 |
| 1632000.0 | 334.247 |
| 1633000.0 | 235.721 |
| 1634000.0 | 240.54 |
| 1635000.0 | 257.315 |
| 1636000.0 | 228.17 |
| 1637000.0 | 229.521 |
| 1638000.0 | 227.934 |
| 1639000.0 | 232.437 |
| 1640000.0 | 223.018 |
| 1641000.0 | 212.859 |
| 1642000.0 | 221.47 |
| 1643000.0 | 227.028 |
| 1644000.0 | 267.63 |
| 1645000.0 | 260.694 |
| 1646000.0 | 268.182 |
| 1647000.0 | 232.233 |
| 1648000.0 | 247.546 |
| 1649000.0 | 234.669 |
| 1650000.0 | 227.44 |
| 1651000.0 | 228.146 |
| 1652000.0 | 233.527 |
| 1653000.0 | 235.165 |
| 1654000.0 | 220.276 |
| 1655000.0 | 262.787 |
| 1656000.0 | 248.85 |
| 1657000.0 | 237.087 |
| 1658000.0 | 196.628 |
| 1659000.0 | 224.26 |
| 1660000.0 | 236.291 |
| 1661000.0 | 217.2 |
| 1662000.0 | 224.58 |
| 1663000.0 | 202.876 |
| 1664000.0 | 211.036 |
| 1665000.0 | 221.476 |
| 1666000.0 | 221.448 |
| 1667000.0 | 230.229 |
| 1668000.0 | 223.618 |
| 1669000.0 | 232.773 |
| 1670000.0 | 262.716 |
| 1671000.0 | 239.576 |
| 1672000.0 | 231.85 |
| 1673000.0 | 237.069 |
| 1674000.0 | 252.16 |
| 1675000.0 | 230.18 |
| 1676000.0 | 243.651 |
| 1677000.0 | 259.994 |
| 1678000.0 | 231.455 |
| 1679000.0 | 218.204 |
| 1680000.0 | 210.718 |
| 1681000.0 | 210.803 |
| 1682000.0 | 217.214 |
| 1683000.0 | 202.34 |
| 1684000.0 | 229.083 |
| 1685000.0 | 205.379 |
| 1686000.0 | 206.645 |
| 1687000.0 | 231.206 |
| 1688000.0 | 207.104 |
| 1689000.0 | 216.277 |
| 1690000.0 | 240.673 |
| 1691000.0 | 274.081 |
| 1692000.0 | 300.573 |
| 1693000.0 | 307.961 |
| 1694000.0 | 271.365 |
| 1695000.0 | 234.986 |
| 1696000.0 | 219.905 |
| 1697000.0 | 227.138 |
| 1698000.0 | 224.656 |
| 1699000.0 | 238.831 |
| 1700000.0 | 222.585 |
| 1701000.0 | 236.386 |
| 1702000.0 | 230.849 |
| 1703000.0 | 197.777 |
| 1704000.0 | 228.654 |
| 1705000.0 | 207.44 |
| 1706000.0 | 218.229 |
| 1707000.0 | 218.274 |
| 1708000.0 | 240.562 |
| 1709000.0 | 250.998 |
| 1710000.0 | 257.473 |
| 1711000.0 | 211.893 |
| 1712000.0 | 223.186 |
| 1713000.0 | 203.273 |
| 1714000.0 | 223.605 |
| 1715000.0 | 243.909 |
| 1716000.0 | 211.663 |
| 1717000.0 | 203.187 |
| 1718000.0 | 237.086 |
| 1719000.0 | 201.696 |
| 1720000.0 | 290.769 |
| 1721000.0 | 288.241 |
| 1722000.0 | 284.905 |
| 1723000.0 | 274.814 |
| 1724000.0 | 327.031 |
| 1725000.0 | 296.263 |
| 1726000.0 | 286.613 |
| 1727000.0 | 274.109 |
| 1728000.0 | 257.693 |
| 1729000.0 | 309.99 |
| 1730000.0 | 255.885 |
| 1731000.0 | 212.774 |
| 1732000.0 | 211.533 |
| 1733000.0 | 202.193 |
| 1734000.0 | 207.702 |
| 1735000.0 | 220.231 |
| 1736000.0 | 236.094 |
| 1737000.0 | 240.527 |
| 1738000.0 | 235.978 |
| 1739000.0 | 214.811 |
| 1740000.0 | 232.573 |
| 1741000.0 | 225.025 |
| 1742000.0 | 224.009 |
| 1743000.0 | 211.596 |
| 1744000.0 | 215.694 |
| 1745000.0 | 204.667 |
| 1746000.0 | 238.569 |
| 1747000.0 | 278.21 |
| 1748000.0 | 233.528 |
| 1749000.0 | 225.771 |
| 1750000.0 | 225.713 |
| 1751000.0 | 235.832 |
| 1752000.0 | 217.975 |
| 1753000.0 | 275.99 |
| 1754000.0 | 239.248 |
| 1755000.0 | 248.804 |
| 1756000.0 | 253.316 |
| 1757000.0 | 260.944 |
| 1758000.0 | 259.017 |
| 1759000.0 | 239.857 |
| 1760000.0 | 258.519 |
| 1761000.0 | 304.142 |
| 1762000.0 | 257.721 |
| 1763000.0 | 238.236 |
| 1764000.0 | 270.347 |
| 1765000.0 | 298.556 |
| 1766000.0 | 321.565 |
| 1767000.0 | 266.8 |
| 1768000.0 | 223.923 |
| 1769000.0 | 215.735 |
| 1770000.0 | 268.258 |
| 1771000.0 | 214.379 |
| 1772000.0 | 221.652 |
| 1773000.0 | 250.719 |
| 1774000.0 | 220.23 |
| 1775000.0 | 207.085 |
| 1776000.0 | 230.591 |
| 1777000.0 | 216.734 |
| 1778000.0 | 228.411 |
| 1779000.0 | 192.632 |
| 1780000.0 | 204.315 |
| 1781000.0 | 259.597 |
| 1782000.0 | 208.507 |
| 1783000.0 | 224.573 |
| 1784000.0 | 215.021 |
| 1785000.0 | 210.941 |
| 1786000.0 | 218.349 |
| 1787000.0 | 195.903 |
| 1788000.0 | 223.064 |
| 1789000.0 | 228.733 |
| 1790000.0 | 250.896 |
| 1791000.0 | 278.423 |
| 1792000.0 | 302.484 |
| 1793000.0 | 242.357 |
| 1794000.0 | 213.703 |
| 1795000.0 | 214.463 |
| 1796000.0 | 200.277 |
| 1797000.0 | 253.351 |
| 1798000.0 | 219.231 |
| 1799000.0 | 255.63 |
| 1800000.0 | 247.806 |
| 1801000.0 | 218.202 |
| 1802000.0 | 237.939 |
| 1803000.0 | 220.45 |
| 1804000.0 | 210.38 |
| 1805000.0 | 228.734 |
| 1806000.0 | 212.852 |
| 1807000.0 | 210.238 |
| 1808000.0 | 266.591 |
| 1809000.0 | 247.276 |
| 1810000.0 | 242.395 |
| 1811000.0 | 226.311 |
| 1812000.0 | 211.123 |
| 1813000.0 | 243.558 |
| 1814000.0 | 220.651 |
| 1815000.0 | 216.324 |
| 1816000.0 | 225.627 |
| 1817000.0 | 205.311 |
| 1818000.0 | 217.042 |
| 1819000.0 | 242.421 |
| 1820000.0 | 195.99 |
| 1821000.0 | 191.152 |
| 1822000.0 | 214.527 |
| 1823000.0 | 206.803 |
| 1824000.0 | 209.087 |
| 1825000.0 | 218.549 |
| 1826000.0 | 285.495 |
| 1827000.0 | 262.539 |
| 1828000.0 | 211.368 |
| 1829000.0 | 228.747 |
| 1830000.0 | 224.124 |
| 1831000.0 | 213.691 |
| 1832000.0 | 201.005 |
| 1833000.0 | 245.185 |
| 1834000.0 | 224.019 |
| 1835000.0 | 216.468 |
| 1836000.0 | 236.814 |
| 1837000.0 | 219.913 |
| 1838000.0 | 221.692 |
| 1839000.0 | 209.805 |
| 1840000.0 | 245.118 |
| 1841000.0 | 251.673 |
| 1842000.0 | 282.92 |
| 1843000.0 | 243.264 |
| 1844000.0 | 246.82 |
| 1845000.0 | 236.109 |
| 1846000.0 | 223.509 |
| 1847000.0 | 242.444 |
| 1848000.0 | 264.271 |
| 1849000.0 | 243.891 |
| 1850000.0 | 229.194 |
| 1851000.0 | 226.1 |
| 1852000.0 | 237.399 |
| 1853000.0 | 260.072 |
| 1854000.0 | 243.706 |
| 1855000.0 | 230.778 |
| 1856000.0 | 259.156 |
| 1857000.0 | 219.33 |
| 1858000.0 | 200.974 |
| 1859000.0 | 222.123 |
| 1860000.0 | 205.58 |
| 1861000.0 | 198.76 |
| 1862000.0 | 202.535 |
| 1863000.0 | 239.974 |
| 1864000.0 | 206.809 |
| 1865000.0 | 244.657 |
| 1866000.0 | 234.176 |
| 1867000.0 | 211.458 |
| 1868000.0 | 219.841 |
| 1869000.0 | 229.629 |
| 1870000.0 | 252.352 |
| 1871000.0 | 205.589 |
| 1872000.0 | 251.042 |
| 1873000.0 | 225.389 |
| 1874000.0 | 200.145 |
| 1875000.0 | 213.286 |
| 1876000.0 | 228.289 |
| 1877000.0 | 217.27 |
| 1878000.0 | 221.884 |
| 1879000.0 | 227.474 |
| 1880000.0 | 200.201 |
| 1881000.0 | 236.062 |
| 1882000.0 | 232.711 |
| 1883000.0 | 227.002 |
| 1884000.0 | 308.903 |
| 1885000.0 | 250.517 |
| 1886000.0 | 220.196 |
| 1887000.0 | 221.183 |
| 1888000.0 | 213.922 |
| 1889000.0 | 227.79 |
| 1890000.0 | 226.929 |
| 1891000.0 | 217.836 |
| 1892000.0 | 225.994 |
| 1893000.0 | 230.675 |
| 1894000.0 | 252.018 |
| 1895000.0 | 214.284 |
| 1896000.0 | 223.285 |
| 1897000.0 | 192.076 |
| 1898000.0 | 227.823 |
| 1899000.0 | 229.902 |
| 1900000.0 | 221.454 |
| 1901000.0 | 197.823 |
| 1902000.0 | 206.008 |
| 1903000.0 | 222.816 |
| 1904000.0 | 221.919 |
| 1905000.0 | 252.549 |
| 1906000.0 | 239.276 |
| 1907000.0 | 235.382 |
| 1908000.0 | 216.872 |
| 1909000.0 | 233.729 |
| 1910000.0 | 248.885 |
| 1911000.0 | 249.898 |
| 1912000.0 | 220.73 |
| 1913000.0 | 235.908 |
| 1914000.0 | 249.635 |
| 1915000.0 | 200.559 |
| 1916000.0 | 223.461 |
| 1917000.0 | 238.84 |
| 1918000.0 | 235.44 |
| 1919000.0 | 196.516 |
| 1920000.0 | 217.178 |
| 1921000.0 | 224.469 |
| 1922000.0 | 226.353 |
| 1923000.0 | 216.376 |
| 1924000.0 | 241.02 |
| 1925000.0 | 211.189 |
| 1926000.0 | 225.651 |
| 1927000.0 | 209.284 |
| 1928000.0 | 209.991 |
| 1929000.0 | 245.773 |
| 1930000.0 | 216.811 |
| 1931000.0 | 219.847 |
| 1932000.0 | 264.288 |
| 1933000.0 | 227.918 |
| 1934000.0 | 197.152 |
| 1935000.0 | 229.186 |
| 1936000.0 | 262.633 |
| 1937000.0 | 286.608 |
| 1938000.0 | 258.409 |
| 1939000.0 | 242.876 |
| 1940000.0 | 212.476 |
| 1941000.0 | 234.039 |
| 1942000.0 | 219.877 |
| 1943000.0 | 222.679 |
| 1944000.0 | 219.15 |
| 1945000.0 | 233.941 |
| 1946000.0 | 225.306 |
| 1947000.0 | 226.784 |
| 1948000.0 | 209.96 |
| 1949000.0 | 205.252 |
| 1950000.0 | 213.397 |
| 1951000.0 | 233.389 |
| 1952000.0 | 261.372 |
| 1953000.0 | 285.762 |
| 1954000.0 | 292.484 |
| 1955000.0 | 262.401 |
| 1956000.0 | 276.528 |
| 1957000.0 | 245.633 |
| 1958000.0 | 239.412 |
| 1959000.0 | 280.846 |
| 1960000.0 | 282.254 |
| 1961000.0 | 285.904 |
| 1962000.0 | 284.612 |
| 1963000.0 | 272.461 |
| 1964000.0 | 285.833 |
| 1965000.0 | 254.976 |
| 1966000.0 | 250.44 |
| 1967000.0 | 216.247 |
| 1968000.0 | 262.077 |
| 1969000.0 | 248.886 |
| 1970000.0 | 224.229 |
| 1971000.0 | 260.272 |
| 1972000.0 | 225.176 |
| 1973000.0 | 235.87 |
| 1974000.0 | 250.077 |
| 1975000.0 | 215.458 |
| 1976000.0 | 227.709 |
| 1977000.0 | 208.08 |
| 1978000.0 | 210.246 |
| 1979000.0 | 213.376 |
| 1980000.0 | 228.257 |
| 1981000.0 | 223.693 |
| 1982000.0 | 237.973 |
| 1983000.0 | 223.335 |
| 1984000.0 | 204.533 |
| 1985000.0 | 215.898 |
| 1986000.0 | 220.101 |
| 1987000.0 | 244.495 |
| 1988000.0 | 230.245 |
| 1989000.0 | 203.597 |
| 1990000.0 | 211.309 |
| 1991000.0 | 260.559 |
| 1992000.0 | 262.586 |
| 1993000.0 | 295.276 |
| 1994000.0 | 223.702 |
| 1995000.0 | 239.573 |
| 1996000.0 | 207.244 |
| 1997000.0 | 225.656 |
| 1998000.0 | 223.623 |
| 1999000.0 | 218.156 |
| 2000000.0 | 218.532 |
| 2001000.0 | 217.546 |
| 2002000.0 | 225.33 |
| 2003000.0 | 224.636 |
| 2004000.0 | 215.813 |
| 2005000.0 | 248.556 |
| 2006000.0 | 230.162 |
| 2007000.0 | 222.983 |
| 2008000.0 | 231.002 |
| 2009000.0 | 202.124 |
| 2010000.0 | 206.052 |
| 2011000.0 | 205.286 |
| 2012000.0 | 221.43 |
| 2013000.0 | 210.168 |
| 2014000.0 | 225.652 |
| 2015000.0 | 216.731 |
| 2016000.0 | 206.908 |
| 2017000.0 | 228.17 |
| 2018000.0 | 195.898 |
| 2019000.0 | 208.365 |
| 2020000.0 | 212.71 |
| 2021000.0 | 230.865 |
| 2022000.0 | 247.18 |
| 2023000.0 | 296.955 |
| 2024000.0 | 227.53 |
| 2025000.0 | 228.974 |
| 2026000.0 | 252.21 |
| 2027000.0 | 248.925 |
| 2028000.0 | 266.342 |
| 2029000.0 | 233.271 |
| 2030000.0 | 260.977 |
| 2031000.0 | 217.945 |
| 2032000.0 | 213.974 |
| 2033000.0 | 245.897 |
| 2034000.0 | 245 |
| 2035000.0 | 269.382 |
| 2036000.0 | 232.445 |
| 2037000.0 | 232.046 |
| 2038000.0 | 214.571 |
| 2039000.0 | 242.959 |
| 2040000.0 | 246.924 |
| 2041000.0 | 244.315 |
| 2042000.0 | 217.423 |
| 2043000.0 | 212.156 |
| 2044000.0 | 220.887 |
| 2045000.0 | 232.606 |
| 2046000.0 | 252.117 |
| 2047000.0 | 243.735 |
| 2048000.0 | 231.359 |
| 2049000.0 | 246.731 |
| 2050000.0 | 243.225 |
| 2051000.0 | 232.768 |
| 2052000.0 | 233.26 |
| 2053000.0 | 227.834 |
| 2054000.0 | 201.933 |
| 2055000.0 | 199.389 |
| 2056000.0 | 259.757 |
| 2057000.0 | 207.832 |
| 2058000.0 | 199.684 |
| 2059000.0 | 216.22 |
| 2060000.0 | 192.734 |
| 2061000.0 | 195.126 |
| 2062000.0 | 209.808 |
| 2063000.0 | 190.164 |
| 2064000.0 | 219.633 |
| 2065000.0 | 224.448 |
| 2066000.0 | 200.131 |
| 2067000.0 | 229.608 |
| 2068000.0 | 285.434 |
| 2069000.0 | 261.893 |
| 2070000.0 | 226.31 |
| 2071000.0 | 239.824 |
| 2072000.0 | 226.862 |
| 2073000.0 | 214.769 |
| 2074000.0 | 194.571 |
| 2075000.0 | 206.184 |
| 2076000.0 | 227.85 |
| 2077000.0 | 225.619 |
| 2078000.0 | 287.471 |
| 2079000.0 | 275.347 |
| 2080000.0 | 282.613 |
| 2081000.0 | 226.718 |
| 2082000.0 | 238.832 |
| 2083000.0 | 246.755 |
| 2084000.0 | 251.648 |
| 2085000.0 | 221.362 |
| 2086000.0 | 219.319 |
| 2087000.0 | 283.148 |
| 2088000.0 | 276.588 |
| 2089000.0 | 247.581 |
| 2090000.0 | 247.616 |
| 2091000.0 | 223.829 |
| 2092000.0 | 215.464 |
| 2093000.0 | 247.737 |
| 2094000.0 | 288.152 |
| 2095000.0 | 228.484 |
| 2096000.0 | 222.23 |
| 2097000.0 | 241.883 |
| 2098000.0 | 212.362 |
| 2099000.0 | 194.151 |
| 2100000.0 | 213.647 |
| 2101000.0 | 195.78 |
| 2102000.0 | 203.733 |
| 2103000.0 | 205.341 |
| 2104000.0 | 206.82 |
| 2105000.0 | 214.638 |
| 2106000.0 | 206.63 |
| 2107000.0 | 202.686 |
| 2108000.0 | 213.373 |
| 2109000.0 | 205.574 |
| 2110000.0 | 211.868 |
| 2111000.0 | 206.872 |
| 2112000.0 | 200.609 |
| 2113000.0 | 192.711 |
| 2114000.0 | 226.232 |
| 2115000.0 | 271.018 |
| 2116000.0 | 268.633 |
| 2117000.0 | 268.314 |
| 2118000.0 | 218.5 |
| 2119000.0 | 221.251 |
| 2120000.0 | 212.886 |
| 2121000.0 | 205.098 |
| 2122000.0 | 214.442 |
| 2123000.0 | 194.34 |
| 2124000.0 | 214.967 |
| 2125000.0 | 192.478 |
| 2126000.0 | 190.735 |
| 2127000.0 | 211.843 |
| 2128000.0 | 211.445 |
| 2129000.0 | 198.581 |
| 2130000.0 | 205 |
| 2131000.0 | 210.785 |
| 2132000.0 | 203.142 |
| 2133000.0 | 234.997 |
| 2134000.0 | 231.117 |
| 2135000.0 | 229.977 |
| 2136000.0 | 241.481 |
| 2137000.0 | 211.894 |
| 2138000.0 | 232.199 |
| 2139000.0 | 218.424 |
| 2140000.0 | 217.826 |
| 2141000.0 | 238.271 |
| 2142000.0 | 283.92 |
| 2143000.0 | 266.903 |
| 2144000.0 | 236.844 |
| 2145000.0 | 247.915 |
| 2146000.0 | 217.13 |
| 2147000.0 | 215.345 |
| 2148000.0 | 237.927 |
| 2149000.0 | 230.696 |
| 2150000.0 | 226.087 |
| 2151000.0 | 214.323 |
| 2152000.0 | 213.038 |
| 2153000.0 | 221.114 |
| 2154000.0 | 227.555 |
| 2155000.0 | 200.058 |
| 2156000.0 | 216.308 |
| 2157000.0 | 229.336 |
| 2158000.0 | 260.377 |
| 2159000.0 | 270.396 |
| 2160000.0 | 257.25 |
| 2161000.0 | 244.652 |
| 2162000.0 | 291.842 |
| 2163000.0 | 283.471 |
| 2164000.0 | 273.394 |
| 2165000.0 | 285.966 |
| 2166000.0 | 282.221 |
| 2167000.0 | 328.69 |
| 2168000.0 | 334.617 |
| 2169000.0 | 345.18 |
| 2170000.0 | 320.611 |
| 2171000.0 | 322.101 |
| 2172000.0 | 253.702 |
| 2173000.0 | 262.7 |
| 2174000.0 | 278.435 |
| 2175000.0 | 292.632 |
| 2176000.0 | 279.607 |
| 2177000.0 | 257.247 |
| 2178000.0 | 262.267 |
| 2179000.0 | 270.579 |
| 2180000.0 | 245.355 |
| 2181000.0 | 237.412 |
| 2182000.0 | 196.45 |
| 2183000.0 | 203.418 |
| 2184000.0 | 215.087 |
| 2185000.0 | 215.756 |
| 2186000.0 | 223.581 |
| 2187000.0 | 217.817 |
| 2188000.0 | 181.521 |
| 2189000.0 | 202.189 |
| 2190000.0 | 195.323 |
| 2191000.0 | 188.727 |
| 2192000.0 | 194.41 |
| 2193000.0 | 192.631 |
| 2194000.0 | 215.186 |
| 2195000.0 | 235.444 |
| 2196000.0 | 241.406 |
| 2197000.0 | 227.733 |
| 2198000.0 | 194.061 |
| 2199000.0 | 232.135 |
| 2200000.0 | 221.165 |
| 2201000.0 | 231.809 |
| 2202000.0 | 216.156 |
| 2203000.0 | 253.153 |
| 2204000.0 | 248.874 |
| 2205000.0 | 217.629 |
| 2206000.0 | 222.138 |
| 2207000.0 | 208.82 |
| 2208000.0 | 224.234 |
| 2209000.0 | 220.291 |
| 2210000.0 | 234.935 |
| 2211000.0 | 213.359 |
| 2212000.0 | 211.834 |
| 2213000.0 | 211.322 |
| 2214000.0 | 207.651 |
| 2215000.0 | 222.011 |
| 2216000.0 | 204.591 |
| 2217000.0 | 216.465 |
| 2218000.0 | 201.088 |
| 2219000.0 | 197.842 |
| 2220000.0 | 192.988 |
| 2221000.0 | 209.459 |
| 2222000.0 | 222.493 |
| 2223000.0 | 216.658 |
| 2224000.0 | 202.178 |
| 2225000.0 | 217.251 |
| 2226000.0 | 240.253 |
| 2227000.0 | 244.728 |
| 2228000.0 | 200.458 |
| 2229000.0 | 200.95 |
| 2230000.0 | 225.61 |
| 2231000.0 | 235.997 |
| 2232000.0 | 307.894 |
| 2233000.0 | 343.834 |
| 2234000.0 | 250.474 |
| 2235000.0 | 219.369 |
| 2236000.0 | 236.024 |
| 2237000.0 | 234.9 |
| 2238000.0 | 209.789 |
| 2239000.0 | 211.968 |
| 2240000.0 | 201.724 |
| 2241000.0 | 198.258 |
| 2242000.0 | 198.768 |
| 2243000.0 | 269.536 |
| 2244000.0 | 289.381 |
| 2245000.0 | 259.316 |
| 2246000.0 | 251.51 |
| 2247000.0 | 280.776 |
| 2248000.0 | 295.04 |
| 2249000.0 | 251.196 |
| 2250000.0 | 218.96 |
| 2251000.0 | 214.398 |
| 2252000.0 | 243.755 |
| 2253000.0 | 268.371 |
| 2254000.0 | 240.921 |
| 2255000.0 | 220.862 |
| 2256000.0 | 216.318 |
| 2257000.0 | 245.723 |
| 2258000.0 | 208.738 |
| 2259000.0 | 202.409 |
| 2260000.0 | 192.855 |
| 2261000.0 | 213.934 |
| 2262000.0 | 235.622 |
| 2263000.0 | 222.429 |
| 2264000.0 | 234.209 |
| 2265000.0 | 223.257 |
| 2266000.0 | 206.374 |
| 2267000.0 | 231.372 |
| 2268000.0 | 214.837 |
| 2269000.0 | 202.892 |
| 2270000.0 | 188.537 |
| 2271000.0 | 224.778 |
| 2272000.0 | 186.154 |
| 2273000.0 | 190.945 |
| 2274000.0 | 220.495 |
| 2275000.0 | 201.34 |
| 2276000.0 | 210.103 |
| 2277000.0 | 208.5 |
| 2278000.0 | 231.25 |
| 2279000.0 | 218.522 |
| 2280000.0 | 207.209 |
| 2281000.0 | 220.92 |
| 2282000.0 | 243.993 |
| 2283000.0 | 229.765 |
| 2284000.0 | 216.596 |
| 2285000.0 | 212.476 |
| 2286000.0 | 250.938 |
| 2287000.0 | 233.599 |
| 2288000.0 | 253.549 |
| 2289000.0 | 233.56 |
| 2290000.0 | 210.919 |
| 2291000.0 | 231.402 |
| 2292000.0 | 225.599 |
| 2293000.0 | 212.738 |
| 2294000.0 | 208.724 |
| 2295000.0 | 262.977 |
| 2296000.0 | 223.13 |
| 2297000.0 | 221.357 |
| 2298000.0 | 214.739 |
| 2299000.0 | 247.787 |
| 2300000.0 | 206.67 |
| 2301000.0 | 215.041 |
| 2302000.0 | 243.327 |
| 2303000.0 | 219.48 |
| 2304000.0 | 210.631 |
| 2305000.0 | 186.932 |
| 2306000.0 | 206.593 |
| 2307000.0 | 224.288 |
| 2308000.0 | 219.853 |
| 2309000.0 | 206.382 |
| 2310000.0 | 282.59 |
| 2311000.0 | 245.053 |
| 2312000.0 | 244.471 |
| 2313000.0 | 211.795 |
| 2314000.0 | 261.932 |
| 2315000.0 | 256.364 |
| 2316000.0 | 232.905 |
| 2317000.0 | 226.982 |
| 2318000.0 | 222.908 |
| 2319000.0 | 223.599 |
| 2320000.0 | 202.348 |
| 2321000.0 | 219.754 |
| 2322000.0 | 215.389 |
| 2323000.0 | 233.202 |
| 2324000.0 | 213.68 |
| 2325000.0 | 218.195 |
| 2326000.0 | 213.48 |
| 2327000.0 | 237.144 |
| 2328000.0 | 218.44 |
| 2329000.0 | 246.044 |
| 2330000.0 | 254.974 |
| 2331000.0 | 239.13 |
| 2332000.0 | 254.978 |
| 2333000.0 | 321.04 |
| 2334000.0 | 305.948 |
| 2335000.0 | 266.415 |
| 2336000.0 | 267.565 |
| 2337000.0 | 231.914 |
| 2338000.0 | 237.869 |
| 2339000.0 | 319.958 |
| 2340000.0 | 262.033 |
| 2341000.0 | 220.314 |
| 2342000.0 | 224.583 |
| 2343000.0 | 238.294 |
| 2344000.0 | 241.796 |
| 2345000.0 | 212.236 |
| 2346000.0 | 272.982 |
| 2347000.0 | 283.192 |
| 2348000.0 | 213.675 |
| 2349000.0 | 269.132 |
| 2350000.0 | 295.557 |
| 2351000.0 | 283.681 |
| 2352000.0 | 285.898 |
| 2353000.0 | 256.454 |
| 2354000.0 | 240.991 |
| 2355000.0 | 219.611 |
| 2356000.0 | 208.861 |
| 2357000.0 | 205.108 |
| 2358000.0 | 209.361 |
| 2359000.0 | 225.959 |
| 2360000.0 | 264.42 |
| 2361000.0 | 222.709 |
| 2362000.0 | 209.378 |
| 2363000.0 | 213.235 |
| 2364000.0 | 190.859 |
| 2365000.0 | 196.652 |
| 2366000.0 | 241.584 |
| 2367000.0 | 260.826 |
| 2368000.0 | 254.769 |
| 2369000.0 | 227.872 |
| 2370000.0 | 234.506 |
| 2371000.0 | 251.4 |
| 2372000.0 | 217.906 |
| 2373000.0 | 222.748 |
| 2374000.0 | 222.765 |
| 2375000.0 | 216.754 |
| 2376000.0 | 206.101 |
| 2377000.0 | 251.31 |
| 2378000.0 | 263.587 |
| 2379000.0 | 260.891 |
| 2380000.0 | 309.074 |
| 2381000.0 | 219.029 |
| 2382000.0 | 251.48 |
| 2383000.0 | 219.135 |
| 2384000.0 | 237.292 |
| 2385000.0 | 229.21 |
| 2386000.0 | 218.94 |
| 2387000.0 | 251.378 |
| 2388000.0 | 260.822 |
| 2389000.0 | 233.861 |
| 2390000.0 | 212.638 |
| 2391000.0 | 216.185 |
| 2392000.0 | 201.206 |
| 2393000.0 | 203.984 |
| 2394000.0 | 216.125 |
| 2395000.0 | 268.138 |
| 2396000.0 | 275.947 |
| 2397000.0 | 215.118 |
| 2398000.0 | 208.312 |
| 2399000.0 | 221.893 |
| 2400000.0 | 223.238 |
| 2401000.0 | 239.035 |
| 2402000.0 | 222.416 |
| 2403000.0 | 219.016 |
| 2404000.0 | 260.602 |
| 2405000.0 | 203.822 |
| 2406000.0 | 221.48 |
| 2407000.0 | 196.61 |
| 2408000.0 | 239.252 |
| 2409000.0 | 210.127 |
| 2410000.0 | 209.22 |
| 2411000.0 | 215.494 |
| 2412000.0 | 226.572 |
| 2413000.0 | 191.458 |
| 2414000.0 | 198.543 |
| 2415000.0 | 217.909 |
| 2416000.0 | 195.529 |
| 2417000.0 | 193.389 |
| 2418000.0 | 215.614 |
| 2419000.0 | 212.058 |
| 2420000.0 | 228.478 |
| 2421000.0 | 226.733 |
| 2422000.0 | 220.157 |
| 2423000.0 | 228.055 |
| 2424000.0 | 255.445 |
| 2425000.0 | 219.069 |
| 2426000.0 | 208.187 |
| 2427000.0 | 191.332 |
| 2428000.0 | 226.929 |
| 2429000.0 | 194.169 |
| 2430000.0 | 211.666 |
| 2431000.0 | 214.674 |
| 2432000.0 | 218.889 |
| 2433000.0 | 198.414 |
| 2434000.0 | 196.894 |
| 2435000.0 | 237.242 |
| 2436000.0 | 206.487 |
| 2437000.0 | 215.252 |
| 2438000.0 | 214.55 |
| 2439000.0 | 223.975 |
| 2440000.0 | 276.035 |
| 2441000.0 | 219.753 |
| 2442000.0 | 297.609 |
| 2443000.0 | 233.818 |
| 2444000.0 | 239.62 |
| 2445000.0 | 197.522 |
| 2446000.0 | 201.853 |
| 2447000.0 | 210.032 |
| 2448000.0 | 256.268 |
| 2449000.0 | 228.465 |
| 2450000.0 | 226.746 |
| 2451000.0 | 210.106 |
| 2452000.0 | 230.109 |
| 2453000.0 | 210.945 |
| 2454000.0 | 216.039 |
| 2455000.0 | 212.272 |
| 2456000.0 | 216.904 |
| 2457000.0 | 247.852 |
| 2458000.0 | 233.447 |
| 2459000.0 | 223.221 |
| 2460000.0 | 224.024 |
| 2461000.0 | 221.212 |
| 2462000.0 | 216.366 |
| 2463000.0 | 219.288 |
| 2464000.0 | 229.422 |
| 2465000.0 | 218.274 |
| 2466000.0 | 229.474 |
| 2467000.0 | 236.024 |
| 2468000.0 | 233.507 |
| 2469000.0 | 241.819 |
| 2470000.0 | 226.959 |
| 2471000.0 | 220.341 |
| 2472000.0 | 249.094 |
| 2473000.0 | 253.679 |
| 2474000.0 | 221.852 |
| 2475000.0 | 234.664 |
| 2476000.0 | 235.134 |
| 2477000.0 | 227.629 |
| 2478000.0 | 187.788 |
| 2479000.0 | 209.399 |
| 2480000.0 | 230.213 |
| 2481000.0 | 223.731 |
| 2482000.0 | 194.33 |
| 2483000.0 | 208.741 |
| 2484000.0 | 215.23 |
| 2485000.0 | 207.646 |
| 2486000.0 | 207.226 |
| 2487000.0 | 275.435 |
| 2488000.0 | 254.576 |
| 2489000.0 | 252.999 |
| 2490000.0 | 215.702 |
| 2491000.0 | 204.753 |
| 2492000.0 | 195.001 |
| 2493000.0 | 224.053 |
| 2494000.0 | 202.825 |
| 2495000.0 | 211.934 |
| 2496000.0 | 214.596 |
| 2497000.0 | 224.243 |
| 2498000.0 | 224.356 |
| 2499000.0 | 232.443 |
| 2500000.0 | 199.055 |
| 2501000.0 | 189.75 |
| 2502000.0 | 218.435 |
| 2503000.0 | 257.382 |
| 2504000.0 | 253.671 |
| 2505000.0 | 240.951 |
| 2506000.0 | 217.985 |
| 2507000.0 | 265.53 |
| 2508000.0 | 250.381 |
| 2509000.0 | 219.251 |
| 2510000.0 | 214.042 |
| 2511000.0 | 230.922 |
| 2512000.0 | 230.792 |
| 2513000.0 | 238.282 |
| 2514000.0 | 242.304 |
| 2515000.0 | 255.036 |
| 2516000.0 | 258.389 |
| 2517000.0 | 222.085 |
| 2518000.0 | 255.931 |
| 2519000.0 | 210.494 |
| 2520000.0 | 212.408 |
| 2521000.0 | 186.001 |
| 2522000.0 | 209.106 |
| 2523000.0 | 229.328 |
| 2524000.0 | 218.372 |
| 2525000.0 | 209.841 |
| 2526000.0 | 250.391 |
| 2527000.0 | 247.788 |
| 2528000.0 | 231.138 |
| 2529000.0 | 240.451 |
| 2530000.0 | 233.445 |
| 2531000.0 | 208.448 |
| 2532000.0 | 254.986 |
| 2533000.0 | 251.604 |
| 2534000.0 | 247.263 |
| 2535000.0 | 245.155 |
| 2536000.0 | 253.265 |
| 2537000.0 | 247.794 |
| 2538000.0 | 203.434 |
| 2539000.0 | 215.174 |
| 2540000.0 | 211.204 |
| 2541000.0 | 196.182 |
| 2542000.0 | 215.45 |
| 2543000.0 | 234.413 |
| 2544000.0 | 235.861 |
| 2545000.0 | 251.8 |
| 2546000.0 | 216.39 |
| 2547000.0 | 256.656 |
| 2548000.0 | 209.353 |
| 2549000.0 | 214.71 |
| 2550000.0 | 209.396 |
| 2551000.0 | 232.369 |
| 2552000.0 | 223.78 |
| 2553000.0 | 221.096 |
| 2554000.0 | 207.961 |
| 2555000.0 | 210.959 |
| 2556000.0 | 201.994 |
| 2557000.0 | 251.401 |
| 2558000.0 | 234.611 |
| 2559000.0 | 216.477 |
| 2560000.0 | 205.637 |
| 2561000.0 | 232.086 |
| 2562000.0 | 200.005 |
| 2563000.0 | 269.456 |
| 2564000.0 | 228.696 |
| 2565000.0 | 223.703 |
| 2566000.0 | 209.655 |
| 2567000.0 | 217.772 |
| 2568000.0 | 200.734 |
| 2569000.0 | 220.148 |
| 2570000.0 | 191.558 |
| 2571000.0 | 199.516 |
| 2572000.0 | 202.709 |
| 2573000.0 | 200.35 |
| 2574000.0 | 203.721 |
| 2575000.0 | 202.459 |
| 2576000.0 | 202.565 |
| 2577000.0 | 209.722 |
| 2578000.0 | 218.131 |
| 2579000.0 | 235.329 |
| 2580000.0 | 280.411 |
| 2581000.0 | 221.649 |
| 2582000.0 | 204.271 |
| 2583000.0 | 229.808 |
| 2584000.0 | 232.213 |
| 2585000.0 | 226.983 |
| 2586000.0 | 233.266 |
| 2587000.0 | 218.392 |
| 2588000.0 | 269.299 |
| 2589000.0 | 284.751 |
| 2590000.0 | 248.616 |
| 2591000.0 | 203.686 |
| 2592000.0 | 227.543 |
| 2593000.0 | 227.669 |
| 2594000.0 | 219.895 |
| 2595000.0 | 212.601 |
| 2596000.0 | 210.739 |
| 2597000.0 | 210.443 |
| 2598000.0 | 252.577 |
| 2599000.0 | 244.08 |
| 2600000.0 | 180.452 |
| 2601000.0 | 177.485 |
| 2602000.0 | 203.624 |
| 2603000.0 | 214.792 |
| 2604000.0 | 207.48 |
| 2605000.0 | 235.901 |
| 2606000.0 | 242.932 |
| 2607000.0 | 217.76 |
| 2608000.0 | 224.063 |
| 2609000.0 | 198.999 |
| 2610000.0 | 206.285 |
| 2611000.0 | 219.486 |
| 2612000.0 | 210.744 |
| 2613000.0 | 249.556 |
| 2614000.0 | 218.051 |
| 2615000.0 | 238.053 |
| 2616000.0 | 238.526 |
| 2617000.0 | 239.973 |
| 2618000.0 | 209.081 |
| 2619000.0 | 242.981 |
| 2620000.0 | 235.96 |
| 2621000.0 | 297.826 |
| 2622000.0 | 277.993 |
| 2623000.0 | 292.754 |
| 2624000.0 | 218.42 |
| 2625000.0 | 225.622 |
| 2626000.0 | 228.613 |
| 2627000.0 | 210.712 |
| 2628000.0 | 198.348 |
| 2629000.0 | 231.863 |
| 2630000.0 | 204.114 |
| 2631000.0 | 196.109 |
| 2632000.0 | 198.028 |
| 2633000.0 | 209.576 |
| 2634000.0 | 251.186 |
| 2635000.0 | 268.389 |
| 2636000.0 | 212.106 |
| 2637000.0 | 217.819 |
| 2638000.0 | 200.471 |
| 2639000.0 | 194.415 |
| 2640000.0 | 218.74 |
| 2641000.0 | 203.882 |
| 2642000.0 | 205.752 |
| 2643000.0 | 221.031 |
| 2644000.0 | 202.25 |
| 2645000.0 | 205.035 |
| 2646000.0 | 214.018 |
| 2647000.0 | 210.634 |
| 2648000.0 | 226.995 |
| 2649000.0 | 211.815 |
| 2650000.0 | 223.718 |
| 2651000.0 | 275.374 |
| 2652000.0 | 248.278 |
| 2653000.0 | 208.469 |
| 2654000.0 | 219.761 |
| 2655000.0 | 212.838 |
| 2656000.0 | 216.452 |
| 2657000.0 | 220.344 |
| 2658000.0 | 215.652 |
| 2659000.0 | 242.955 |
| 2660000.0 | 224.055 |
| 2661000.0 | 237.876 |
| 2662000.0 | 212.295 |
| 2663000.0 | 208.828 |
| 2664000.0 | 207.866 |
| 2665000.0 | 219.506 |
| 2666000.0 | 232.076 |
| 2667000.0 | 203.814 |
| 2668000.0 | 181.131 |
| 2669000.0 | 209.542 |
| 2670000.0 | 192.023 |
| 2671000.0 | 203.502 |
| 2672000.0 | 214.523 |
| 2673000.0 | 219.854 |
| 2674000.0 | 203.266 |
| 2675000.0 | 267.627 |
| 2676000.0 | 223.304 |
| 2677000.0 | 211.503 |
| 2678000.0 | 239.768 |
| 2679000.0 | 201.902 |
| 2680000.0 | 199.062 |
| 2681000.0 | 228.994 |
| 2682000.0 | 234.3 |
| 2683000.0 | 210.464 |
| 2684000.0 | 225.05 |
| 2685000.0 | 226.351 |
| 2686000.0 | 236.296 |
| 2687000.0 | 249.765 |
| 2688000.0 | 195.808 |
| 2689000.0 | 200.375 |
| 2690000.0 | 187.86 |
| 2691000.0 | 204.008 |
| 2692000.0 | 222.785 |
| 2693000.0 | 201.75 |
| 2694000.0 | 221.459 |
| 2695000.0 | 196.855 |
| 2696000.0 | 221.896 |
| 2697000.0 | 243.011 |
| 2698000.0 | 261.552 |
| 2699000.0 | 295.077 |
| 2700000.0 | 216.229 |
| 2701000.0 | 256.865 |
| 2702000.0 | 232.733 |
| 2703000.0 | 212.84 |
| 2704000.0 | 205.673 |
| 2705000.0 | 210.996 |
| 2706000.0 | 214.754 |
| 2707000.0 | 234.774 |
| 2708000.0 | 240.083 |
| 2709000.0 | 216.741 |
| 2710000.0 | 199.815 |
| 2711000.0 | 201.752 |
| 2712000.0 | 208.27 |
| 2713000.0 | 243.805 |
| 2714000.0 | 236.321 |
| 2715000.0 | 216.653 |
| 2716000.0 | 209.144 |
| 2717000.0 | 213.61 |
| 2718000.0 | 199.493 |
| 2719000.0 | 237.192 |
| 2720000.0 | 248.872 |
| 2721000.0 | 261.47 |
| 2722000.0 | 261.99 |
| 2723000.0 | 214.777 |
| 2724000.0 | 239.461 |
| 2725000.0 | 224.629 |
| 2726000.0 | 239.032 |
| 2727000.0 | 210.022 |
| 2728000.0 | 219.195 |
| 2729000.0 | 242.828 |
| 2730000.0 | 322.664 |
| 2731000.0 | 307.939 |
| 2732000.0 | 310.048 |
| 2733000.0 | 286.79 |
| 2734000.0 | 286.102 |
| 2735000.0 | 242.426 |
| 2736000.0 | 227.21 |
| 2737000.0 | 191.944 |
| 2738000.0 | 204.622 |
| 2739000.0 | 229.891 |
| 2740000.0 | 221.893 |
| 2741000.0 | 224.137 |
| 2742000.0 | 213.427 |
| 2743000.0 | 238.007 |
| 2744000.0 | 218.816 |
| 2745000.0 | 219.304 |
| 2746000.0 | 225.954 |
| 2747000.0 | 230.964 |
| 2748000.0 | 233.134 |
| 2749000.0 | 235.758 |
| 2750000.0 | 233.15 |
| 2751000.0 | 209.56 |
| 2752000.0 | 221.972 |
| 2753000.0 | 243.102 |
| 2754000.0 | 227.854 |
| 2755000.0 | 217.597 |
| 2756000.0 | 213.317 |
| 2757000.0 | 237.151 |
| 2758000.0 | 222.318 |
| 2759000.0 | 264.349 |
| 2760000.0 | 232.877 |
| 2761000.0 | 279.739 |
| 2762000.0 | 278.043 |
| 2763000.0 | 240.572 |
| 2764000.0 | 218.08 |
| 2765000.0 | 229.738 |
| 2766000.0 | 277.496 |
| 2767000.0 | 279.901 |
| 2768000.0 | 224.511 |
| 2769000.0 | 266.329 |
| 2770000.0 | 289.893 |
| 2771000.0 | 264.729 |
| 2772000.0 | 237.967 |
| 2773000.0 | 210.681 |
| 2774000.0 | 209.903 |
| 2775000.0 | 252.115 |
| 2776000.0 | 241.701 |
| 2777000.0 | 248.515 |
| 2778000.0 | 218.571 |
| 2779000.0 | 225.512 |
| 2780000.0 | 240.612 |
| 2781000.0 | 230.879 |
| 2782000.0 | 225.262 |
| 2783000.0 | 214.392 |
| 2784000.0 | 206.667 |
| 2785000.0 | 230.44 |
| 2786000.0 | 222.446 |
| 2787000.0 | 252.437 |
| 2788000.0 | 206.018 |
| 2789000.0 | 235.282 |
| 2790000.0 | 222.04 |
| 2791000.0 | 215.115 |
| 2792000.0 | 209.056 |
| 2793000.0 | 257.016 |
| 2794000.0 | 250.044 |
| 2795000.0 | 217.272 |
| 2796000.0 | 224.329 |
| 2797000.0 | 274.988 |
| 2798000.0 | 341.657 |
| 2799000.0 | 324.151 |
| 2800000.0 | 295.444 |
| 2801000.0 | 371.206 |
| 2802000.0 | 311.966 |
| 2803000.0 | 252.08 |
| 2804000.0 | 225.717 |
| 2805000.0 | 234.822 |
| 2806000.0 | 217.328 |
| 2807000.0 | 258.018 |
| 2808000.0 | 236.382 |
| 2809000.0 | 240.998 |
| 2810000.0 | 227.176 |
| 2811000.0 | 233.757 |
| 2812000.0 | 222.255 |
| 2813000.0 | 246.804 |
| 2814000.0 | 247.583 |
| 2815000.0 | 240.484 |
| 2816000.0 | 235.862 |
| 2817000.0 | 255.386 |
| 2818000.0 | 235.55 |
| 2819000.0 | 204.087 |
| 2820000.0 | 242.869 |
| 2821000.0 | 248.677 |
| 2822000.0 | 247.519 |
| 2823000.0 | 229.498 |
| 2824000.0 | 215.931 |
| 2825000.0 | 213.073 |
| 2826000.0 | 247.87 |
| 2827000.0 | 251.98 |
| 2828000.0 | 287.337 |
| 2829000.0 | 216.448 |
| 2830000.0 | 220.034 |
| 2831000.0 | 212.253 |
| 2832000.0 | 223.174 |
| 2833000.0 | 202.055 |
| 2834000.0 | 202.676 |
| 2835000.0 | 186.366 |
| 2836000.0 | 195.505 |
| 2837000.0 | 221.709 |
| 2838000.0 | 217.976 |
| 2839000.0 | 218.273 |
| 2840000.0 | 223.433 |
| 2841000.0 | 203.58 |
| 2842000.0 | 201.222 |
| 2843000.0 | 206.343 |
| 2844000.0 | 211.062 |
| 2845000.0 | 259.727 |
| 2846000.0 | 235.744 |
| 2847000.0 | 219.168 |
| 2848000.0 | 212.448 |
| 2849000.0 | 209.623 |
| 2850000.0 | 223.488 |
| 2851000.0 | 209.624 |
| 2852000.0 | 240.661 |
| 2853000.0 | 267.889 |
| 2854000.0 | 291.282 |
| 2855000.0 | 256.035 |
| 2856000.0 | 230.717 |
| 2857000.0 | 213.04 |
| 2858000.0 | 211.669 |
| 2859000.0 | 218.476 |
| 2860000.0 | 205.044 |
| 2861000.0 | 215.09 |
| 2862000.0 | 194.687 |
| 2863000.0 | 208.024 |
| 2864000.0 | 229.067 |
| 2865000.0 | 223.311 |
| 2866000.0 | 208.656 |
| 2867000.0 | 257.136 |
| 2868000.0 | 335.843 |
| 2869000.0 | 309.408 |
| 2870000.0 | 281.937 |
| 2871000.0 | 254.472 |
| 2872000.0 | 181.341 |
| 2873000.0 | 235.959 |
| 2874000.0 | 264.581 |
| 2875000.0 | 263.525 |
| 2876000.0 | 265.772 |
| 2877000.0 | 279.162 |
| 2878000.0 | 238.397 |
| 2879000.0 | 237.553 |
| 2880000.0 | 213.831 |
| 2881000.0 | 296.009 |
| 2882000.0 | 288.638 |
| 2883000.0 | 334.377 |
| 2884000.0 | 233.575 |
| 2885000.0 | 197.848 |
| 2886000.0 | 248.451 |
| 2887000.0 | 334.297 |
| 2888000.0 | 345.569 |
| 2889000.0 | 290.804 |
| 2890000.0 | 220.762 |
| 2891000.0 | 204.592 |
| 2892000.0 | 216.123 |
| 2893000.0 | 280.841 |
| 2894000.0 | 281.153 |
| 2895000.0 | 219.189 |
| 2896000.0 | 214.811 |
| 2897000.0 | 212.684 |
| 2898000.0 | 213.225 |
| 2899000.0 | 198.872 |
| 2900000.0 | 255.405 |
| 2901000.0 | 197.4 |
| 2902000.0 | 315.654 |
| 2903000.0 | 303.313 |
| 2904000.0 | 347.94 |
| 2905000.0 | 333.343 |
| 2906000.0 | 282.013 |
| 2907000.0 | 259.95 |
| 2908000.0 | 294.762 |
| 2909000.0 | 316.018 |
| 2910000.0 | 323.173 |
| 2911000.0 | 285.735 |
| 2912000.0 | 256.951 |
| 2913000.0 | 280.336 |
| 2914000.0 | 251.552 |
| 2915000.0 | 243.851 |
| 2916000.0 | 260.812 |
| 2917000.0 | 243.244 |
| 2918000.0 | 206.803 |
| 2919000.0 | 209.318 |
| 2920000.0 | 218.407 |
| 2921000.0 | 210.271 |
| 2922000.0 | 208.034 |
| 2923000.0 | 212.479 |
| 2924000.0 | 232.955 |
| 2925000.0 | 252.029 |
| 2926000.0 | 263.035 |
| 2927000.0 | 304.432 |
| 2928000.0 | 272.907 |
| 2929000.0 | 308.051 |
| 2930000.0 | 290.613 |
| 2931000.0 | 312.953 |
| 2932000.0 | 247.733 |
| 2933000.0 | 239.864 |
| 2934000.0 | 229.84 |
| 2935000.0 | 225.076 |
| 2936000.0 | 208.564 |
| 2937000.0 | 209.412 |
| 2938000.0 | 238.405 |
| 2939000.0 | 227.309 |
| 2940000.0 | 190.715 |
| 2941000.0 | 208.62 |
| 2942000.0 | 218.276 |
| 2943000.0 | 211.357 |
| 2944000.0 | 221.084 |
| 2945000.0 | 224.293 |
| 2946000.0 | 248.315 |
| 2947000.0 | 236.91 |
| 2948000.0 | 267.524 |
| 2949000.0 | 265.211 |
| 2950000.0 | 238.023 |
| 2951000.0 | 209.926 |
| 2952000.0 | 239.715 |
| 2953000.0 | 214.878 |
| 2954000.0 | 237.656 |
| 2955000.0 | 233.903 |
| 2956000.0 | 256.862 |
| 2957000.0 | 247.261 |
| 2958000.0 | 212.911 |
| 2959000.0 | 233.83 |
| 2960000.0 | 206.301 |
| 2961000.0 | 232.955 |
| 2962000.0 | 261.185 |
| 2963000.0 | 216.351 |
| 2964000.0 | 209.116 |
| 2965000.0 | 245.106 |
| 2966000.0 | 254.2 |
| 2967000.0 | 255.959 |
| 2968000.0 | 231.631 |
| 2969000.0 | 224.134 |
| 2970000.0 | 241.204 |
| 2971000.0 | 260.758 |
| 2972000.0 | 251.163 |
| 2973000.0 | 210.832 |
| 2974000.0 | 234.276 |
| 2975000.0 | 206.848 |
| 2976000.0 | 73.65 |
| 2977000.0 | 223.019 |
| 2978000.0 | 206 |
| 2979000.0 | 250.782 |
| 2980000.0 | 215.06 |
| 2981000.0 | 204.57 |
| 2982000.0 | 243.507 |
| 2983000.0 | 211.001 |
| 2984000.0 | 198.803 |
| 2985000.0 | 211.593 |
| 2986000.0 | 252.755 |
| 2987000.0 | 212.215 |
| 2988000.0 | 204.205 |
| 2989000.0 | 194.556 |
| 2990000.0 | 207.35 |
| 2991000.0 | 241.459 |
| 2992000.0 | 223.322 |
| 2993000.0 | 205.625 |
| 2994000.0 | 214.341 |
| 2995000.0 | 209.351 |
| 2996000.0 | 212.543 |
| 2997000.0 | 204.252 |
| 2998000.0 | 197.042 |
| 2999000.0 | 214.324 |
| 3000000.0 | 252.499 |
| 3001000.0 | 206.474 |
| 3002000.0 | 191.395 |
| 3003000.0 | 207.268 |
| 3004000.0 | 225.839 |
| 3005000.0 | 218.282 |
| 3006000.0 | 202.344 |
| 3007000.0 | 238.449 |
| 3008000.0 | 218.76 |
| 3009000.0 | 208.431 |
| 3010000.0 | 248.894 |
| 3011000.0 | 289.051 |
| 3012000.0 | 271.854 |
| 3013000.0 | 297.101 |
| 3014000.0 | 288.567 |
| 3015000.0 | 265.746 |
| 3016000.0 | 282.082 |
| 3017000.0 | 260.148 |
| 3018000.0 | 277.141 |
| 3019000.0 | 313.431 |
| 3020000.0 | 326.241 |
| 3021000.0 | 281.949 |
| 3022000.0 | 278.454 |
| 3023000.0 | 259.79 |
| 3024000.0 | 285.169 |
| 3025000.0 | 277.206 |
| 3026000.0 | 271.144 |
| 3027000.0 | 234.806 |
| 3028000.0 | 253.705 |
| 3029000.0 | 232.116 |
| 3030000.0 | 216.542 |
| 3031000.0 | 231.925 |
| 3032000.0 | 271.908 |
| 3033000.0 | 277.119 |
| 3034000.0 | 246.433 |
| 3035000.0 | 252.454 |
| 3036000.0 | 228.031 |
| 3037000.0 | 243.233 |
| 3038000.0 | 223.218 |
| 3039000.0 | 285.555 |
| 3040000.0 | 246.718 |
| 3041000.0 | 286.393 |
| 3042000.0 | 243.352 |
| 3043000.0 | 248.563 |
| 3044000.0 | 251.922 |
| 3045000.0 | 277.179 |
| 3046000.0 | 290.546 |
| 3047000.0 | 315.391 |
| 3048000.0 | 267.402 |
| 3049000.0 | 299.268 |
| 3050000.0 | 282.315 |
| 3051000.0 | 237.115 |
| 3052000.0 | 207.326 |
| 3053000.0 | 209.624 |
| 3054000.0 | 210.672 |
| 3055000.0 | 216.575 |
| 3056000.0 | 215.916 |
| 3057000.0 | 207.784 |
| 3058000.0 | 195.937 |
| 3059000.0 | 200.13 |
| 3060000.0 | 200.642 |
| 3061000.0 | 199.244 |
| 3062000.0 | 218.095 |
| 3063000.0 | 212.798 |
| 3064000.0 | 222.481 |
| 3065000.0 | 206.869 |
| 3066000.0 | 229.114 |
| 3067000.0 | 228.11 |
| 3068000.0 | 231.487 |
| 3069000.0 | 219.107 |
| 3070000.0 | 201.055 |
| 3071000.0 | 216.138 |
| 3072000.0 | 217.808 |
| 3073000.0 | 232.586 |
| 3074000.0 | 207.515 |
| 3075000.0 | 239.132 |
| 3076000.0 | 233.816 |
| 3077000.0 | 221.274 |
| 3078000.0 | 227.689 |
| 3079000.0 | 233.125 |
| 3080000.0 | 207.465 |
| 3081000.0 | 222.384 |
| 3082000.0 | 233.169 |
| 3083000.0 | 233.855 |
| 3084000.0 | 213.479 |
| 3085000.0 | 241.126 |
| 3086000.0 | 249.618 |
| 3087000.0 | 264.43 |
| 3088000.0 | 300.242 |
| 3089000.0 | 232.861 |
| 3090000.0 | 215.608 |
| 3091000.0 | 228.825 |
| 3092000.0 | 214.487 |
| 3093000.0 | 249.947 |
| 3094000.0 | 245.554 |
| 3095000.0 | 233.402 |
| 3096000.0 | 226.404 |
| 3097000.0 | 279.99 |
| 3098000.0 | 257.454 |
| 3099000.0 | 245.804 |
| 3100000.0 | 242.256 |
| 3101000.0 | 234.221 |
| 3102000.0 | 281.257 |
| 3103000.0 | 261.602 |
| 3104000.0 | 191.463 |
| 3105000.0 | 221.661 |
| 3106000.0 | 241.772 |
| 3107000.0 | 227.794 |
| 3108000.0 | 230.58 |
| 3109000.0 | 221.032 |
| 3110000.0 | 211.388 |
| 3111000.0 | 216.076 |
| 3112000.0 | 212.958 |
| 3113000.0 | 216.672 |
| 3114000.0 | 221.795 |
| 3115000.0 | 228.304 |
| 3116000.0 | 233.642 |
| 3117000.0 | 233.187 |
| 3118000.0 | 259.58 |
| 3119000.0 | 238.09 |
| 3120000.0 | 220.821 |
| 3121000.0 | 244.546 |
| 3122000.0 | 225.751 |
| 3123000.0 | 243.433 |
| 3124000.0 | 212.681 |
| 3125000.0 | 208.859 |
| 3126000.0 | 218.881 |
| 3127000.0 | 279.467 |
| 3128000.0 | 221.314 |
| 3129000.0 | 215.546 |
| 3130000.0 | 211.712 |
| 3131000.0 | 211.313 |
| 3132000.0 | 217.593 |
| 3133000.0 | 249.134 |
| 3134000.0 | 231.218 |
| 3135000.0 | 224.679 |
| 3136000.0 | 272.698 |
| 3137000.0 | 202.968 |
| 3138000.0 | 243.399 |
| 3139000.0 | 242.505 |
| 3140000.0 | 220.16 |
| 3141000.0 | 235.71 |
| 3142000.0 | 222.503 |
| 3143000.0 | 248.069 |
| 3144000.0 | 220.067 |
| 3145000.0 | 216.026 |
| 3146000.0 | 201.69 |
| 3147000.0 | 220.624 |
| 3148000.0 | 213.448 |
| 3149000.0 | 199.953 |
| 3150000.0 | 219.405 |
| 3151000.0 | 225.255 |
| 3152000.0 | 235.418 |
| 3153000.0 | 248.304 |
| 3154000.0 | 228.794 |
| 3155000.0 | 213.331 |
| 3156000.0 | 232.774 |
| 3157000.0 | 213.356 |
| 3158000.0 | 219.702 |
| 3159000.0 | 243.026 |
| 3160000.0 | 220.93 |
| 3161000.0 | 232.92 |
| 3162000.0 | 201.324 |
| 3163000.0 | 259.653 |
| 3164000.0 | 234.614 |
| 3165000.0 | 238.839 |
| 3166000.0 | 238.625 |
| 3167000.0 | 212.652 |
| 3168000.0 | 194.259 |
| 3169000.0 | 210.931 |
| 3170000.0 | 201.853 |
| 3171000.0 | 241.06 |
| 3172000.0 | 217.275 |
| 3173000.0 | 215.839 |
| 3174000.0 | 215.312 |
| 3175000.0 | 223.612 |
| 3176000.0 | 239.597 |
| 3177000.0 | 223.28 |
| 3178000.0 | 258.552 |
| 3179000.0 | 249.5 |
| 3180000.0 | 238.052 |
| 3181000.0 | 218.981 |
| 3182000.0 | 239.962 |
| 3183000.0 | 251.196 |
| 3184000.0 | 254.197 |
| 3185000.0 | 226.882 |
| 3186000.0 | 239.253 |
| 3187000.0 | 275.85 |
| 3188000.0 | 296.002 |
| 3189000.0 | 216.985 |
| 3190000.0 | 214.502 |
| 3191000.0 | 244.735 |
| 3192000.0 | 277.165 |
| 3193000.0 | 287.445 |
| 3194000.0 | 291.013 |
| 3195000.0 | 290.223 |
| 3196000.0 | 263.485 |
| 3197000.0 | 242.337 |
| 3198000.0 | 247.163 |
| 3199000.0 | 231.52 |
| 3200000.0 | 242.795 |
| 3201000.0 | 234.716 |
| 3202000.0 | 231.015 |
| 3203000.0 | 210.495 |
| 3204000.0 | 218.248 |
| 3205000.0 | 236.137 |
| 3206000.0 | 223.202 |
| 3207000.0 | 235.073 |
| 3208000.0 | 219.241 |
| 3209000.0 | 247.957 |
| 3210000.0 | 261.35 |
| 3211000.0 | 243.43 |
| 3212000.0 | 312.146 |
| 3213000.0 | 242.623 |
| 3214000.0 | 229.985 |
| 3215000.0 | 207.809 |
| 3216000.0 | 219.635 |
| 3217000.0 | 244.873 |
| 3218000.0 | 223.077 |
| 3219000.0 | 215.641 |
| 3220000.0 | 223.215 |
| 3221000.0 | 209.657 |
| 3222000.0 | 237.52 |
| 3223000.0 | 240.681 |
| 3224000.0 | 224.52 |
| 3225000.0 | 222.188 |
| 3226000.0 | 221.439 |
| 3227000.0 | 224.227 |
| 3228000.0 | 214.767 |
| 3229000.0 | 222.704 |
| 3230000.0 | 252.662 |
| 3231000.0 | 216.97 |
| 3232000.0 | 247.336 |
| 3233000.0 | 235.577 |
| 3234000.0 | 239.994 |
| 3235000.0 | 205.806 |
| 3236000.0 | 219.435 |
| 3237000.0 | 214.84 |
| 3238000.0 | 242.487 |
| 3239000.0 | 236.685 |
| 3240000.0 | 221.851 |
| 3241000.0 | 226.228 |
| 3242000.0 | 273.316 |
| 3243000.0 | 277.377 |
| 3244000.0 | 237.578 |
| 3245000.0 | 236.467 |
| 3246000.0 | 249.527 |
| 3247000.0 | 276.462 |
| 3248000.0 | 265.767 |
| 3249000.0 | 268.225 |
| 3250000.0 | 233.961 |
| 3251000.0 | 231.767 |
| 3252000.0 | 258.251 |
| 3253000.0 | 221.418 |
| 3254000.0 | 222.33 |
| 3255000.0 | 226.967 |
| 3256000.0 | 217.684 |
| 3257000.0 | 224.959 |
| 3258000.0 | 208.585 |
| 3259000.0 | 209.799 |
| 3260000.0 | 206.052 |
| 3261000.0 | 208.937 |
| 3262000.0 | 244.179 |
| 3263000.0 | 217.003 |
| 3264000.0 | 220.04 |
| 3265000.0 | 244.586 |
| 3266000.0 | 257.279 |
| 3267000.0 | 228.591 |
| 3268000.0 | 223.741 |
| 3269000.0 | 219.989 |
| 3270000.0 | 239.276 |
| 3271000.0 | 243.039 |
| 3272000.0 | 250.184 |
| 3273000.0 | 234.786 |
| 3274000.0 | 210.402 |
| 3275000.0 | 222.561 |
| 3276000.0 | 227.931 |
| 3277000.0 | 291.486 |
| 3278000.0 | 286.014 |
| 3279000.0 | 253.944 |
| 3280000.0 | 247.781 |
| 3281000.0 | 253.629 |
| 3282000.0 | 265.896 |
| 3283000.0 | 240.767 |
| 3284000.0 | 290.005 |
| 3285000.0 | 265.78 |
| 3286000.0 | 245.103 |
| 3287000.0 | 243.141 |
| 3288000.0 | 263.89 |
| 3289000.0 | 248.315 |
| 3290000.0 | 218.402 |
| 3291000.0 | 248.034 |
| 3292000.0 | 256.401 |
| 3293000.0 | 279.97 |
| 3294000.0 | 300.646 |
| 3295000.0 | 257.915 |
| 3296000.0 | 234.839 |
| 3297000.0 | 242.23 |
| 3298000.0 | 210.715 |
| 3299000.0 | 217.811 |
| 3300000.0 | 218.949 |
| 3301000.0 | 279.87 |
| 3302000.0 | 296.444 |
| 3303000.0 | 247.693 |
| 3304000.0 | 236.52 |
| 3305000.0 | 232.244 |
| 3306000.0 | 227.602 |
| 3307000.0 | 227.645 |
| 3308000.0 | 233.024 |
| 3309000.0 | 239.131 |
| 3310000.0 | 223.372 |
| 3311000.0 | 209.988 |
| 3312000.0 | 240.637 |
| 3313000.0 | 242.018 |
| 3314000.0 | 235.125 |
| 3315000.0 | 240.746 |
| 3316000.0 | 223.316 |
| 3317000.0 | 255.634 |
| 3318000.0 | 273.37 |
| 3319000.0 | 239.255 |
| 3320000.0 | 226.84 |
| 3321000.0 | 251.341 |
| 3322000.0 | 218.465 |
| 3323000.0 | 223.704 |
| 3324000.0 | 236.795 |
| 3325000.0 | 221.703 |
| 3326000.0 | 227.846 |
| 3327000.0 | 234.739 |
| 3328000.0 | 213.095 |
| 3329000.0 | 295.783 |
| 3330000.0 | 216.823 |
| 3331000.0 | 211.88 |
| 3332000.0 | 254.075 |
| 3333000.0 | 225.332 |
| 3334000.0 | 228.558 |
| 3335000.0 | 241.257 |
| 3336000.0 | 219.384 |
| 3337000.0 | 244.865 |
| 3338000.0 | 225.195 |
| 3339000.0 | 228.38 |
| 3340000.0 | 215.621 |
| 3341000.0 | 243.959 |
| 3342000.0 | 220.781 |
| 3343000.0 | 227.88 |
| 3344000.0 | 223.508 |
| 3345000.0 | 210.546 |
| 3346000.0 | 237.277 |
| 3347000.0 | 229.894 |
| 3348000.0 | 245.049 |
| 3349000.0 | 244.637 |
| 3350000.0 | 226.659 |
| 3351000.0 | 215.479 |
| 3352000.0 | 245.327 |
| 3353000.0 | 229.563 |
| 3354000.0 | 205.675 |
| 3355000.0 | 304.201 |
| 3356000.0 | 213.309 |
| 3357000.0 | 291.592 |
| 3358000.0 | 274.98 |
| 3359000.0 | 228.283 |
| 3360000.0 | 239.458 |
| 3361000.0 | 225.962 |
| 3362000.0 | 206.097 |
| 3363000.0 | 229.807 |
| 3364000.0 | 189.134 |
| 3365000.0 | 218.753 |
| 3366000.0 | 206.752 |
| 3367000.0 | 207.804 |
| 3368000.0 | 223.841 |
| 3369000.0 | 242.312 |
| 3370000.0 | 205.36 |
| 3371000.0 | 215.509 |
| 3372000.0 | 242.999 |
| 3373000.0 | 204.203 |
| 3374000.0 | 224.039 |
| 3375000.0 | 255.555 |
| 3376000.0 | 234.24 |
| 3377000.0 | 263.061 |
| 3378000.0 | 243.812 |
| 3379000.0 | 240.457 |
| 3380000.0 | 253.767 |
| 3381000.0 | 245.513 |
| 3382000.0 | 235.586 |
| 3383000.0 | 299.809 |
| 3384000.0 | 228.026 |
| 3385000.0 | 257.463 |
| 3386000.0 | 207.135 |
| 3387000.0 | 226.696 |
| 3388000.0 | 199.608 |
| 3389000.0 | 211.143 |
| 3390000.0 | 229.698 |
| 3391000.0 | 221.096 |
| 3392000.0 | 229.122 |
| 3393000.0 | 221.032 |
| 3394000.0 | 241.539 |
| 3395000.0 | 228.513 |
| 3396000.0 | 264.753 |
| 3397000.0 | 250.201 |
| 3398000.0 | 233.821 |
| 3399000.0 | 236.311 |
| 3400000.0 | 256.085 |
| 3401000.0 | 224.657 |
| 3402000.0 | 216.213 |
| 3403000.0 | 209.309 |
| 3404000.0 | 218.153 |
| 3405000.0 | 243.45 |
| 3406000.0 | 209.053 |
| 3407000.0 | 229.299 |
| 3408000.0 | 221.74 |
| 3409000.0 | 249.494 |
| 3410000.0 | 233.562 |
| 3411000.0 | 245.667 |
| 3412000.0 | 241.263 |
| 3413000.0 | 272.47 |
| 3414000.0 | 314.352 |
| 3415000.0 | 265.4 |
| 3416000.0 | 222.546 |
| 3417000.0 | 222.085 |
| 3418000.0 | 217.443 |
| 3419000.0 | 282.151 |
| 3420000.0 | 195.285 |
| 3421000.0 | 257.938 |
| 3422000.0 | 238.556 |
| 3423000.0 | 279.847 |
| 3424000.0 | 257.281 |
| 3425000.0 | 290.42 |
| 3426000.0 | 242.727 |
| 3427000.0 | 249.804 |
| 3428000.0 | 232.388 |
| 3429000.0 | 224.84 |
| 3430000.0 | 224.895 |
| 3431000.0 | 231.199 |
| 3432000.0 | 229.466 |
| 3433000.0 | 210.876 |
| 3434000.0 | 213.326 |
| 3435000.0 | 205.303 |
| 3436000.0 | 205.635 |
| 3437000.0 | 221.901 |
| 3438000.0 | 219.463 |
| 3439000.0 | 217.428 |
| 3440000.0 | 221.017 |
| 3441000.0 | 220.44 |
| 3442000.0 | 217.575 |
| 3443000.0 | 239.93 |
| 3444000.0 | 251.672 |
| 3445000.0 | 275.472 |
| 3446000.0 | 221.549 |
| 3447000.0 | 211.47 |
| 3448000.0 | 228.985 |
| 3449000.0 | 266.617 |
| 3450000.0 | 224.37 |
| 3451000.0 | 223.393 |
| 3452000.0 | 246.021 |
| 3453000.0 | 256.968 |
| 3454000.0 | 260.047 |
| 3455000.0 | 227.495 |
| 3456000.0 | 218.832 |
| 3457000.0 | 242.555 |
| 3458000.0 | 217.802 |
| 3459000.0 | 268.755 |
| 3460000.0 | 230.219 |
| 3461000.0 | 262.125 |
| 3462000.0 | 266.923 |
| 3463000.0 | 227.75 |
| 3464000.0 | 235.433 |
| 3465000.0 | 231.354 |
| 3466000.0 | 225.936 |
| 3467000.0 | 245.26 |
| 3468000.0 | 262.579 |
| 3469000.0 | 227.412 |
| 3470000.0 | 222.065 |
| 3471000.0 | 225.023 |
| 3472000.0 | 213.351 |
| 3473000.0 | 236.413 |
| 3474000.0 | 245.517 |
| 3475000.0 | 248.083 |
| 3476000.0 | 213.807 |
| 3477000.0 | 234.197 |
| 3478000.0 | 234.287 |
| 3479000.0 | 207.547 |
| 3480000.0 | 218.104 |
| 3481000.0 | 215.216 |
| 3482000.0 | 231.454 |
| 3483000.0 | 249.273 |
| 3484000.0 | 232.171 |
| 3485000.0 | 224.419 |
| 3486000.0 | 243.253 |
| 3487000.0 | 234.907 |
| 3488000.0 | 246.526 |
| 3489000.0 | 233.466 |
| 3490000.0 | 208.992 |
| 3491000.0 | 222.965 |
| 3492000.0 | 218.605 |
| 3493000.0 | 244.745 |
| 3494000.0 | 243.89 |
| 3495000.0 | 254.706 |
| 3496000.0 | 212.805 |
| 3497000.0 | 210.917 |
| 3498000.0 | 215.563 |
| 3499000.0 | 218.859 |
| 3500000.0 | 223.44 |
| 3501000.0 | 248.041 |
| 3502000.0 | 236.318 |
| 3503000.0 | 202.909 |
| 3504000.0 | 217.57 |
| 3505000.0 | 232.273 |
| 3506000.0 | 220.244 |
| 3507000.0 | 212.922 |
| 3508000.0 | 202.655 |
| 3509000.0 | 230.219 |
| 3510000.0 | 244.949 |
| 3511000.0 | 242.966 |
| 3512000.0 | 256.982 |
| 3513000.0 | 256.917 |
| 3514000.0 | 244.68 |
| 3515000.0 | 225.064 |
| 3516000.0 | 226.346 |
| 3517000.0 | 227.688 |
| 3518000.0 | 235.441 |
| 3519000.0 | 228.337 |
| 3520000.0 | 183.815 |
| 3521000.0 | 193.67 |
| 3522000.0 | 217.744 |
| 3523000.0 | 258.023 |
| 3524000.0 | 230.969 |
| 3525000.0 | 227.738 |
| 3526000.0 | 271.1 |
| 3527000.0 | 238.266 |
| 3528000.0 | 249.935 |
| 3529000.0 | 263.176 |
| 3530000.0 | 251.272 |
| 3531000.0 | 225.218 |
| 3532000.0 | 223.248 |
| 3533000.0 | 235.64 |
| 3534000.0 | 242.623 |
| 3535000.0 | 233.015 |
| 3536000.0 | 215.041 |
| 3537000.0 | 223.885 |
| 3538000.0 | 232.552 |
| 3539000.0 | 219.3 |
| 3540000.0 | 206.93 |
| 3541000.0 | 225.433 |
| 3542000.0 | 224.336 |
| 3543000.0 | 211.529 |
| 3544000.0 | 212.952 |
| 3545000.0 | 230.118 |
| 3546000.0 | 227.185 |
| 3547000.0 | 253.339 |
| 3548000.0 | 230.979 |
| 3549000.0 | 241.726 |
| 3550000.0 | 247.775 |
| 3551000.0 | 223.135 |
| 3552000.0 | 240.001 |
| 3553000.0 | 202.274 |
| 3554000.0 | 222.289 |
| 3555000.0 | 237.339 |
| 3556000.0 | 266.746 |
| 3557000.0 | 262.192 |
| 3558000.0 | 256.831 |
| 3559000.0 | 226.753 |
| 3560000.0 | 239.287 |
| 3561000.0 | 306.041 |
| 3562000.0 | 244.052 |
| 3563000.0 | 247.396 |
| 3564000.0 | 259.011 |
| 3565000.0 | 234.876 |
| 3566000.0 | 265.2 |
| 3567000.0 | 272.28 |
| 3568000.0 | 378.324 |
| 3569000.0 | 331.002 |
| 3570000.0 | 402.192 |
| 3571000.0 | 473.879 |
| 3572000.0 | 375.354 |
| 3573000.0 | 283.785 |
| 3574000.0 | 238.055 |
| 3575000.0 | 233.018 |
| 3576000.0 | 246.946 |
| 3577000.0 | 244.06 |
| 3578000.0 | 230.021 |
| 3579000.0 | 243.556 |
| 3580000.0 | 221.442 |
| 3581000.0 | 251.568 |
| 3582000.0 | 280.411 |
| 3583000.0 | 267.484 |
| 3584000.0 | 245.905 |
| 3585000.0 | 255.551 |
| 3586000.0 | 262.415 |
| 3587000.0 | 258.878 |
| 3588000.0 | 250.698 |
| 3589000.0 | 260.642 |
| 3590000.0 | 252.616 |
| 3591000.0 | 286.68 |
| 3592000.0 | 275.558 |
| 3593000.0 | 231.318 |
| 3594000.0 | 272.974 |
| 3595000.0 | 254.345 |
| 3596000.0 | 246.915 |
| 3597000.0 | 262.777 |
| 3598000.0 | 251.117 |
| 3599000.0 | 272.762 |
| 3600000.0 | 261.946 |
| 3601000.0 | 256.472 |
| 3602000.0 | 250.581 |
| 3603000.0 | 257.574 |
| 3604000.0 | 233.248 |
| 3605000.0 | 254.457 |
| 3606000.0 | 264.702 |
| 3607000.0 | 238.524 |
| 3608000.0 | 236.849 |
| 3609000.0 | 193.909 |
| 3610000.0 | 250.477 |
| 3611000.0 | 201.493 |
| 3612000.0 | 225.361 |
| 3613000.0 | 249.246 |
| 3614000.0 | 213.262 |
| 3615000.0 | 226.421 |
| 3616000.0 | 261.399 |
| 3617000.0 | 223.432 |
| 3618000.0 | 226.556 |
| 3619000.0 | 212.564 |
| 3620000.0 | 223.908 |
| 3621000.0 | 205.388 |
| 3622000.0 | 257.233 |
| 3623000.0 | 227.498 |
| 3624000.0 | 257.259 |
| 3625000.0 | 218.445 |
| 3626000.0 | 217.212 |
| 3627000.0 | 251.575 |
| 3628000.0 | 224.01 |
| 3629000.0 | 240.215 |
| 3630000.0 | 229.513 |
| 3631000.0 | 209.616 |
| 3632000.0 | 253.358 |
| 3633000.0 | 223.234 |
| 3634000.0 | 222.346 |
| 3635000.0 | 236.842 |
| 3636000.0 | 300.936 |
| 3637000.0 | 229.355 |
| 3638000.0 | 229.478 |
| 3639000.0 | 232.184 |
| 3640000.0 | 262.431 |
| 3641000.0 | 228.183 |
| 3642000.0 | 231.979 |
| 3643000.0 | 236.507 |
| 3644000.0 | 223.289 |
| 3645000.0 | 217.96 |
| 3646000.0 | 207.671 |
| 3647000.0 | 239.107 |
| 3648000.0 | 213.85 |
| 3649000.0 | 205.78 |
| 3650000.0 | 224.951 |
| 3651000.0 | 235.95 |
| 3652000.0 | 217.089 |
| 3653000.0 | 231.24 |
| 3654000.0 | 221.995 |
| 3655000.0 | 233.52 |
| 3656000.0 | 221.311 |
| 3657000.0 | 268.584 |
| 3658000.0 | 205.83 |
| 3659000.0 | 229.88 |
| 3660000.0 | 218.699 |
| 3661000.0 | 255.136 |
| 3662000.0 | 239.596 |
| 3663000.0 | 214.032 |
| 3664000.0 | 235.612 |
| 3665000.0 | 221.389 |
| 3666000.0 | 218.623 |
| 3667000.0 | 238.719 |
| 3668000.0 | 229.196 |
| 3669000.0 | 224.017 |
| 3670000.0 | 228.052 |
| 3671000.0 | 237.389 |
| 3672000.0 | 230.898 |
| 3673000.0 | 205.029 |
| 3674000.0 | 207.084 |
| 3675000.0 | 199.31 |
| 3676000.0 | 215.507 |
| 3677000.0 | 219.604 |
| 3678000.0 | 220.688 |
| 3679000.0 | 221.031 |
| 3680000.0 | 245.718 |
| 3681000.0 | 230.639 |
| 3682000.0 | 193.519 |
| 3683000.0 | 224.015 |
| 3684000.0 | 199.247 |
| 3685000.0 | 219.153 |
| 3686000.0 | 206.237 |
| 3687000.0 | 220.164 |
| 3688000.0 | 222.096 |
| 3689000.0 | 250.414 |
| 3690000.0 | 228.989 |
| 3691000.0 | 243.753 |
| 3692000.0 | 239.383 |
| 3693000.0 | 227.561 |
| 3694000.0 | 262.439 |
| 3695000.0 | 209.883 |
| 3696000.0 | 233.386 |
| 3697000.0 | 238.052 |
| 3698000.0 | 277.265 |
| 3699000.0 | 264.747 |
| 3700000.0 | 248.002 |
| 3701000.0 | 232.37 |
| 3702000.0 | 234.707 |
| 3703000.0 | 228.498 |
| 3704000.0 | 227.045 |
| 3705000.0 | 235.888 |
| 3706000.0 | 221.277 |
| 3707000.0 | 234.64 |
| 3708000.0 | 222.209 |
| 3709000.0 | 244.493 |
| 3710000.0 | 231.225 |
| 3711000.0 | 213.874 |
| 3712000.0 | 213.565 |
| 3713000.0 | 232.588 |
| 3714000.0 | 240.121 |
| 3715000.0 | 262.245 |
| 3716000.0 | 256.038 |
| 3717000.0 | 302.726 |
| 3718000.0 | 284.154 |
| 3719000.0 | 262.287 |
| 3720000.0 | 244.598 |
| 3721000.0 | 233.074 |
| 3722000.0 | 222.12 |
| 3723000.0 | 231.333 |
| 3724000.0 | 202.118 |
| 3725000.0 | 206.879 |
| 3726000.0 | 214.901 |
| 3727000.0 | 233.828 |
| 3728000.0 | 236.685 |
| 3729000.0 | 226.937 |
| 3730000.0 | 211.126 |
| 3731000.0 | 203.908 |
| 3732000.0 | 230.572 |
| 3733000.0 | 220.927 |
| 3734000.0 | 264.834 |
| 3735000.0 | 227.247 |
| 3736000.0 | 255.788 |
| 3737000.0 | 255.62 |
| 3738000.0 | 208.551 |
| 3739000.0 | 217.431 |
| 3740000.0 | 212.006 |
| 3741000.0 | 209.889 |
| 3742000.0 | 238.991 |
| 3743000.0 | 220.635 |
| 3744000.0 | 202.944 |
| 3745000.0 | 229.478 |
| 3746000.0 | 211.974 |
| 3747000.0 | 225.853 |
| 3748000.0 | 231.997 |
| 3749000.0 | 212.397 |
| 3750000.0 | 222.912 |
| 3751000.0 | 224.744 |
| 3752000.0 | 234.48 |
| 3753000.0 | 232.407 |
| 3754000.0 | 284.243 |
| 3755000.0 | 425.651 |
| 3756000.0 | 435.007 |
| 3757000.0 | 405.079 |
| 3758000.0 | 474.969 |
| 3759000.0 | 484.43 |
| 3760000.0 | 464.591 |
| 3761000.0 | 531.111 |
| 3762000.0 | 519.627 |
| 3763000.0 | 443.373 |
| 3764000.0 | 426.199 |
| 3765000.0 | 485.07 |
| 3766000.0 | 453.459 |
| 3767000.0 | 468.506 |
| 3768000.0 | 506.855 |
| 3769000.0 | 459.136 |
| 3770000.0 | 478.958 |
| 3771000.0 | 458.517 |
| 3772000.0 | 488.854 |
| 3773000.0 | 516.701 |
| 3774000.0 | 528.841 |
| 3775000.0 | 540.974 |
| 3776000.0 | 487.27 |
| 3777000.0 | 451.77 |
| 3778000.0 | 443.73 |
| 3779000.0 | 505.703 |
| 3780000.0 | 503.245 |
| 3781000.0 | 562.681 |
| 3782000.0 | 465.867 |
| 3783000.0 | 490.14 |
| 3784000.0 | 437.252 |
| 3785000.0 | 440.486 |
| 3786000.0 | 449.591 |
| 3787000.0 | 467.184 |
| 3788000.0 | 509.025 |
| 3789000.0 | 452.369 |
| 3790000.0 | 474.227 |
| 3791000.0 | 467.397 |
| 3792000.0 | 485.315 |
| 3793000.0 | 450.918 |
| 3794000.0 | 510.687 |
| 3795000.0 | 462.938 |
| 3796000.0 | 402.998 |
| 3797000.0 | 396.446 |
| 3798000.0 | 450.351 |
| 3799000.0 | 444.739 |
| 3800000.0 | 497.421 |
| 3801000.0 | 430.856 |
| 3802000.0 | 434.139 |
| 3803000.0 | 434.723 |
| 3804000.0 | 447.958 |
| 3805000.0 | 536.935 |
| 3806000.0 | 459.244 |
| 3807000.0 | 481.58 |
| 3808000.0 | 458.036 |
| 3809000.0 | 506.972 |
| 3810000.0 | 528.052 |
| 3811000.0 | 512.86 |
| 3812000.0 | 454.068 |
| 3813000.0 | 446.43 |
| 3814000.0 | 460.117 |
| 3815000.0 | 512.586 |
| 3816000.0 | 512.091 |
| 3817000.0 | 531.089 |
| 3818000.0 | 428.625 |
| 3819000.0 | 440.328 |
| 3820000.0 | 460.891 |
| 3821000.0 | 474.852 |
| 3822000.0 | 503.989 |
| 3823000.0 | 527.276 |
| 3824000.0 | 578.23 |
| 3825000.0 | 470.009 |
| 3826000.0 | 491.456 |
| 3827000.0 | 488.556 |
| 3828000.0 | 593.101 |
| 3829000.0 | 582.726 |
| 3830000.0 | 511.412 |
| 3831000.0 | 458.634 |
| 3832000.0 | 444.255 |
| 3833000.0 | 461.955 |
| 3834000.0 | 430.501 |
| 3835000.0 | 455.704 |
| 3836000.0 | 491.004 |
| 3837000.0 | 552.098 |
| 3838000.0 | 572.056 |
| 3839000.0 | 582.47 |
| 3840000.0 | 608.509 |
| 3841000.0 | 472.574 |
| 3842000.0 | 434.744 |
| 3843000.0 | 489.773 |
| 3844000.0 | 510.757 |
| 3845000.0 | 497.236 |
| 3846000.0 | 413.579 |
| 3847000.0 | 479.109 |
| 3848000.0 | 474.722 |
| 3849000.0 | 471.165 |
| 3850000.0 | 482.628 |
| 3851000.0 | 517.064 |
| 3852000.0 | 463.831 |
| 3853000.0 | 468.066 |
| 3854000.0 | 498.362 |
| 3855000.0 | 454.803 |
| 3856000.0 | 483.149 |
| 3857000.0 | 477.829 |
| 3858000.0 | 499.032 |
| 3859000.0 | 512.001 |
| 3860000.0 | 508.401 |
| 3861000.0 | 485.817 |
| 3862000.0 | 450.258 |
| 3863000.0 | 422.438 |
| 3864000.0 | 450.574 |
| 3865000.0 | 494.999 |
| 3866000.0 | 477.812 |
| 3867000.0 | 450.599 |
| 3868000.0 | 486.528 |
| 3869000.0 | 488.276 |
| 3870000.0 | 503.39 |
| 3871000.0 | 487.7 |
| 3872000.0 | 431.766 |
| 3873000.0 | 450.281 |
| 3874000.0 | 411.877 |
| 3875000.0 | 497.634 |
| 3876000.0 | 496.815 |
| 3877000.0 | 460.775 |
| 3878000.0 | 475.978 |
| 3879000.0 | 456.959 |
| 3880000.0 | 522.143 |
| 3881000.0 | 650.118 |
| 3882000.0 | 511.041 |
| 3883000.0 | 493.902 |
| 3884000.0 | 523.126 |
| 3885000.0 | 510.54 |
| 3886000.0 | 513.854 |
| 3887000.0 | 431.588 |
| 3888000.0 | 442.726 |
| 3889000.0 | 445.458 |
| 3890000.0 | 441.422 |
| 3891000.0 | 454.71 |
| 3892000.0 | 487.183 |
| 3893000.0 | 515.301 |
| 3894000.0 | 515.696 |
| 3895000.0 | 476.877 |
| 3896000.0 | 437.569 |
| 3897000.0 | 508.074 |
| 3898000.0 | 488.094 |
| 3899000.0 | 442.318 |
| 3900000.0 | 443.293 |
| 3901000.0 | 431.566 |
| 3902000.0 | 491.834 |
| 3903000.0 | 602.467 |
| 3904000.0 | 479.861 |
| 3905000.0 | 475.339 |
| 3906000.0 | 552.392 |
| 3907000.0 | 454.834 |
| 3908000.0 | 448.599 |
| 3909000.0 | 631.812 |
| 3910000.0 | 562.222 |
| 3911000.0 | 627.263 |
| 3912000.0 | 619.959 |
| 3913000.0 | 656.584 |
| 3914000.0 | 688.126 |
| 3915000.0 | 594.018 |
| 3916000.0 | 654.068 |
| 3917000.0 | 516.447 |
| 3918000.0 | 520.077 |
| 3919000.0 | 533.454 |
| 3920000.0 | 507.122 |
| 3921000.0 | 472.989 |
| 3922000.0 | 463.5 |
| 3923000.0 | 518.327 |
| 3924000.0 | 431.626 |
| 3925000.0 | 464.542 |
| 3926000.0 | 490.558 |
| 3927000.0 | 462.157 |
| 3928000.0 | 462.505 |
| 3929000.0 | 479.979 |
| 3930000.0 | 518.265 |
| 3931000.0 | 509.311 |
| 3932000.0 | 475.427 |
| 3933000.0 | 497.529 |
| 3934000.0 | 485.723 |
| 3935000.0 | 522.143 |
| 3936000.0 | 457.868 |
| 3937000.0 | 508.615 |
| 3938000.0 | 429.961 |
| 3939000.0 | 453.307 |
| 3940000.0 | 437.135 |
| 3941000.0 | 436.905 |
| 3942000.0 | 491.172 |
| 3943000.0 | 465.012 |
| 3944000.0 | 485.441 |
| 3945000.0 | 451.14 |
| 3946000.0 | 459.514 |
| 3947000.0 | 489.403 |
| 3948000.0 | 454.959 |
| 3949000.0 | 554.289 |
| 3950000.0 | 637.686 |
| 3951000.0 | 545.321 |
| 3952000.0 | 549.78 |
| 3953000.0 | 532.563 |
| 3954000.0 | 688.298 |
| 3955000.0 | 625.097 |
| 3956000.0 | 527.316 |
| 3957000.0 | 546.536 |
| 3958000.0 | 561.245 |
| 3959000.0 | 535.566 |
| 3960000.0 | 668.789 |
| 3961000.0 | 503.914 |
| 3962000.0 | 513.946 |
| 3963000.0 | 495.124 |
| 3964000.0 | 480.363 |
| 3965000.0 | 544.038 |
| 3966000.0 | 540.816 |
| 3967000.0 | 483.333 |
| 3968000.0 | 499.321 |
| 3969000.0 | 415.449 |
| 3970000.0 | 447.888 |
| 3971000.0 | 468.391 |
| 3972000.0 | 503.842 |
| 3973000.0 | 483.074 |
| 3974000.0 | 451.203 |
| 3975000.0 | 486.52 |
| 3976000.0 | 454.293 |
| 3977000.0 | 453.16 |
| 3978000.0 | 451.967 |
| 3979000.0 | 451.073 |
| 3980000.0 | 562.344 |
| 3981000.0 | 579.185 |
| 3982000.0 | 537.158 |
| 3983000.0 | 567.516 |
| 3984000.0 | 615.658 |
| 3985000.0 | 627.216 |
| 3986000.0 | 531.46 |
| 3987000.0 | 485.648 |
| 3988000.0 | 463.848 |
| 3989000.0 | 417.639 |
| 3990000.0 | 428.131 |
| 3991000.0 | 426.044 |
| 3992000.0 | 460.746 |
| 3993000.0 | 466.696 |
| 3994000.0 | 532.198 |
| 3995000.0 | 521.323 |
| 3996000.0 | 501.563 |
| 3997000.0 | 471.884 |
| 3998000.0 | 476.917 |
| 3999000.0 | 515.442 |
| 4000000.0 | 472.355 |
| 4001000.0 | 431.982 |
| 4002000.0 | 451.785 |
| 4003000.0 | 516.132 |
| 4004000.0 | 468.594 |
| 4005000.0 | 476.136 |
| 4006000.0 | 460.995 |
| 4007000.0 | 474.108 |
| 4008000.0 | 460.961 |
| 4009000.0 | 477.304 |
| 4010000.0 | 487.382 |
| 4011000.0 | 553.952 |
| 4012000.0 | 458.141 |
| 4013000.0 | 372.237 |
| 4014000.0 | 352.614 |
| 4015000.0 | 299.283 |
| 4016000.0 | 272.472 |
| 4017000.0 | 280.833 |
| 4018000.0 | 258.302 |
| 4019000.0 | 375.557 |
| 4020000.0 | 541.2 |
| 4021000.0 | 553.825 |
| 4022000.0 | 456.202 |
| 4023000.0 | 476.68 |
| 4024000.0 | 479.045 |
| 4025000.0 | 471.956 |
| 4026000.0 | 474.27 |
| 4027000.0 | 463.305 |
| 4028000.0 | 478.647 |
| 4029000.0 | 487.723 |
| 4030000.0 | 468.742 |
| 4031000.0 | 475.319 |
| 4032000.0 | 412.046 |
| 4033000.0 | 468.813 |
| 4034000.0 | 499.211 |
| 4035000.0 | 507.311 |
| 4036000.0 | 583.966 |
| 4037000.0 | 500.767 |
| 4038000.0 | 453.988 |
| 4039000.0 | 438.992 |
| 4040000.0 | 484.756 |
| 4041000.0 | 473.973 |
| 4042000.0 | 485.169 |
| 4043000.0 | 489.041 |
| 4044000.0 | 445.81 |
| 4045000.0 | 505.789 |
| 4046000.0 | 540.125 |
| 4047000.0 | 498.901 |
| 4048000.0 | 546.587 |
| 4049000.0 | 455.503 |
| 4050000.0 | 480.945 |
| 4051000.0 | 506.814 |
| 4052000.0 | 730.469 |
| 4053000.0 | 751.248 |
| 4054000.0 | 628.521 |
| 4055000.0 | 459.997 |
| 4056000.0 | 483.245 |
| 4057000.0 | 509.001 |
| 4058000.0 | 474.775 |
| 4059000.0 | 445.778 |
| 4060000.0 | 499.68 |
| 4061000.0 | 488.389 |
| 4062000.0 | 464.742 |
| 4063000.0 | 437.025 |
| 4064000.0 | 486.416 |
| 4065000.0 | 492.71 |
| 4066000.0 | 446.67 |
| 4067000.0 | 487.555 |
| 4068000.0 | 505.969 |
| 4069000.0 | 506.582 |
| 4070000.0 | 487.987 |
| 4071000.0 | 522.704 |
| 4072000.0 | 488.832 |
| 4073000.0 | 561.469 |
| 4074000.0 | 511.315 |
| 4075000.0 | 551.654 |
| 4076000.0 | 507.908 |
| 4077000.0 | 530.934 |
| 4078000.0 | 500.312 |
| 4079000.0 | 486.757 |
| 4080000.0 | 524.428 |
| 4081000.0 | 554.128 |
| 4082000.0 | 534.182 |
| 4083000.0 | 500.849 |
| 4084000.0 | 510.492 |
| 4085000.0 | 567.3 |
| 4086000.0 | 493.152 |
| 4087000.0 | 442.462 |
| 4088000.0 | 479.716 |
| 4089000.0 | 500.689 |
| 4090000.0 | 512.812 |
| 4091000.0 | 467.505 |
| 4092000.0 | 502.526 |
| 4093000.0 | 517.492 |
| 4094000.0 | 459.525 |
| 4095000.0 | 474.755 |
| 4096000.0 | 468.285 |
| 4097000.0 | 477.406 |
| 4098000.0 | 493.37 |
| 4099000.0 | 485.807 |
| 4100000.0 | 592.368 |
| 4101000.0 | 413.228 |
| 4102000.0 | 526.714 |
| 4103000.0 | 442.494 |
| 4104000.0 | 381.67 |
| 4105000.0 | 384.477 |
| 4106000.0 | 526.731 |
| 4107000.0 | 545.707 |
| 4108000.0 | 482.076 |
| 4109000.0 | 570.43 |
| 4110000.0 | 455.012 |
| 4111000.0 | 515.925 |
| 4112000.0 | 503.889 |
| 4113000.0 | 459.965 |
| 4114000.0 | 444.356 |
| 4115000.0 | 418.794 |
| 4116000.0 | 549.717 |
| 4117000.0 | 459.907 |
| 4118000.0 | 491.74 |
| 4119000.0 | 480.728 |
| 4120000.0 | 515.916 |
| 4121000.0 | 490.189 |
| 4122000.0 | 499.181 |
| 4123000.0 | 407.83 |
| 4124000.0 | 0 |
| 4125000.0 | 455.023 |
| 4126000.0 | 574.998 |
| 4127000.0 | 532.742 |
| 4128000.0 | 539.336 |
| 4129000.0 | 501.778 |
| 4130000.0 | 509.312 |
| 4131000.0 | 473.961 |
| 4132000.0 | 406.36 |
| 4133000.0 | 465.787 |
| 4134000.0 | 432.129 |
| 4135000.0 | 451.823 |
| 4136000.0 | 442.736 |
| 4137000.0 | 454.766 |
| 4138000.0 | 442.424 |
| 4139000.0 | 433.985 |
| 4140000.0 | 528.377 |
| 4141000.0 | 466.297 |
| 4142000.0 | 540.036 |
| 4143000.0 | 429.536 |
| 4144000.0 | 459.219 |
| 4145000.0 | 441.249 |
| 4146000.0 | 463.717 |
| 4147000.0 | 533.482 |
| 4148000.0 | 485.072 |
| 4149000.0 | 482.245 |
| 4150000.0 | 651.319 |
| 4151000.0 | 547.22 |
| 4152000.0 | 529.407 |
| 4153000.0 | 464.399 |
| 4154000.0 | 459.455 |
| 4155000.0 | 452.28 |
| 4156000.0 | 465.368 |
| 4157000.0 | 463.454 |
| 4158000.0 | 500.079 |
| 4159000.0 | 462.424 |
| 4160000.0 | 645.918 |
| 4161000.0 | 458.95 |
| 4162000.0 | 518.053 |
| 4163000.0 | 478.687 |
| 4164000.0 | 447.656 |
| 4165000.0 | 448.026 |
| 4166000.0 | 454.723 |
| 4167000.0 | 478.849 |
| 4168000.0 | 470.108 |
| 4169000.0 | 461.907 |
| 4170000.0 | 491.273 |
| 4171000.0 | 458.009 |
| 4172000.0 | 469.018 |
| 4173000.0 | 481.38 |
| 4174000.0 | 502.505 |
| 4175000.0 | 500.698 |
| 4176000.0 | 483.864 |
| 4177000.0 | 457.801 |
| 4178000.0 | 561.02 |
| 4179000.0 | 469.234 |
| 4180000.0 | 493.167 |
| 4181000.0 | 535.431 |
| 4182000.0 | 490.341 |
| 4183000.0 | 482.742 |
| 4184000.0 | 497.974 |
| 4185000.0 | 466.532 |
| 4186000.0 | 521.472 |
| 4187000.0 | 655.4 |
| 4188000.0 | 532.046 |
| 4189000.0 | 458.365 |
| 4190000.0 | 465.419 |
| 4191000.0 | 454.86 |
| 4192000.0 | 479.227 |
| 4193000.0 | 481.994 |
| 4194000.0 | 468.468 |
| 4195000.0 | 473.158 |
| 4196000.0 | 534.038 |
| 4197000.0 | 402.081 |
| 4198000.0 | 535.868 |
| 4199000.0 | 461.598 |
| 4200000.0 | 383.87 |
| 4201000.0 | 383.444 |
| 4202000.0 | 414.113 |
| 4203000.0 | 481.846 |
| 4204000.0 | 519.272 |
| 4205000.0 | 548.153 |
| 4206000.0 | 584.307 |
| 4207000.0 | 505.861 |
| 4208000.0 | 463.985 |
| 4209000.0 | 498.844 |
| 4210000.0 | 539.505 |
| 4211000.0 | 523.01 |
| 4212000.0 | 517.166 |
| 4213000.0 | 484.679 |
| 4214000.0 | 458.209 |
| 4215000.0 | 455.731 |
| 4216000.0 | 490.847 |
| 4217000.0 | 473.927 |
| 4218000.0 | 517.998 |
| 4219000.0 | 511.761 |
| 4220000.0 | 536.993 |
| 4221000.0 | 525.019 |
| 4222000.0 | 529.367 |
| 4223000.0 | 576.162 |
| 4224000.0 | 492.633 |
| 4225000.0 | 556.228 |
| 4226000.0 | 644.619 |
| 4227000.0 | 511.07 |
| 4228000.0 | 491.905 |
| 4229000.0 | 464.438 |
| 4230000.0 | 483.045 |
| 4231000.0 | 485.61 |
| 4232000.0 | 499.961 |
| 4233000.0 | 487.103 |
| 4234000.0 | 451.305 |
| 4235000.0 | 516.848 |
| 4236000.0 | 453.001 |
| 4237000.0 | 486.336 |
| 4238000.0 | 485.499 |
| 4239000.0 | 506.963 |
| 4240000.0 | 501.56 |
| 4241000.0 | 545.114 |
| 4242000.0 | 533.774 |
| 4243000.0 | 477.795 |
| 4244000.0 | 463.565 |
| 4245000.0 | 520.246 |
| 4246000.0 | 465.561 |
| 4247000.0 | 485.549 |
| 4248000.0 | 478.82 |
| 4249000.0 | 505.141 |
| 4250000.0 | 569.182 |
| 4251000.0 | 584.263 |
| 4252000.0 | 561.954 |
| 4253000.0 | 468.803 |
| 4254000.0 | 444.468 |
| 4255000.0 | 476.343 |
| 4256000.0 | 469.266 |
| 4257000.0 | 472.557 |
| 4258000.0 | 450.848 |
| 4259000.0 | 490.108 |
| 4260000.0 | 501.553 |
| 4261000.0 | 512.454 |
| 4262000.0 | 470.354 |
| 4263000.0 | 623.187 |
| 4264000.0 | 521.022 |
| 4265000.0 | 430.906 |
| 4266000.0 | 484.252 |
| 4267000.0 | 519.511 |
| 4268000.0 | 444.569 |
| 4269000.0 | 428.432 |
| 4270000.0 | 455.003 |
| 4271000.0 | 491.057 |
| 4272000.0 | 487.801 |
| 4273000.0 | 478.252 |
| 4274000.0 | 530.768 |
| 4275000.0 | 471.233 |
| 4276000.0 | 520.814 |
| 4277000.0 | 490.155 |
| 4278000.0 | 436.756 |
| 4279000.0 | 462.08 |
| 4280000.0 | 494.279 |
| 4281000.0 | 495.256 |
| 4282000.0 | 476.116 |
| 4283000.0 | 508.043 |
| 4284000.0 | 546.392 |
| 4285000.0 | 471.637 |
| 4286000.0 | 430.996 |
| 4287000.0 | 487.758 |
| 4288000.0 | 500.788 |
| 4289000.0 | 522.617 |
| 4290000.0 | 539.178 |
| 4291000.0 | 472.674 |
| 4292000.0 | 491.199 |
| 4293000.0 | 448.907 |
| 4294000.0 | 469.8 |
| 4295000.0 | 421.408 |
| 4296000.0 | 488.878 |
| 4297000.0 | 529.023 |
| 4298000.0 | 514.275 |
| 4299000.0 | 479.267 |
| 4300000.0 | 478.602 |
| 4301000.0 | 482.863 |
| 4302000.0 | 444.413 |
| 4303000.0 | 502.77 |
| 4304000.0 | 450.811 |
| 4305000.0 | 444.672 |
| 4306000.0 | 489.805 |
| 4307000.0 | 524.437 |
| 4308000.0 | 506.842 |
| 4309000.0 | 618.003 |
| 4310000.0 | 520.865 |
| 4311000.0 | 417.55 |
| 4312000.0 | 456.979 |
| 4313000.0 | 436.741 |
| 4314000.0 | 502.231 |
| 4315000.0 | 558.908 |
| 4316000.0 | 551.495 |
| 4317000.0 | 451.168 |
| 4318000.0 | 473.195 |
| 4319000.0 | 492.585 |
| 4320000.0 | 543.865 |
| 4321000.0 | 446.538 |
| 4322000.0 | 449.087 |
| 4323000.0 | 514.98 |
| 4324000.0 | 415.487 |
| 4325000.0 | 442.524 |
| 4326000.0 | 481.984 |
| 4327000.0 | 450.062 |
| 4328000.0 | 485.673 |
| 4329000.0 | 451.709 |
| 4330000.0 | 482.138 |
| 4331000.0 | 446.394 |
| 4332000.0 | 475.283 |
| 4333000.0 | 444.887 |
| 4334000.0 | 501.337 |
| 4335000.0 | 479.679 |
| 4336000.0 | 464.749 |
| 4337000.0 | 442.797 |
| 4338000.0 | 468.42 |
| 4339000.0 | 503.1 |
| 4340000.0 | 513.363 |
| 4341000.0 | 452.834 |
| 4342000.0 | 459.074 |
| 4343000.0 | 489.161 |
| 4344000.0 | 471.505 |
| 4345000.0 | 488.885 |
| 4346000.0 | 518.494 |
| 4347000.0 | 483.731 |
| 4348000.0 | 476.638 |
| 4349000.0 | 480.593 |
| 4350000.0 | 549.097 |
| 4351000.0 | 497.869 |
| 4352000.0 | 396.058 |
| 4353000.0 | 512.456 |
| 4354000.0 | 443.745 |
| 4355000.0 | 379.346 |
| 4356000.0 | 353.346 |
| 4357000.0 | 489.358 |
| 4358000.0 | 495.918 |
| 4359000.0 | 547.565 |
| 4360000.0 | 569.261 |
| 4361000.0 | 522.702 |
| 4362000.0 | 486.206 |
| 4363000.0 | 496.566 |
| 4364000.0 | 509.359 |
| 4365000.0 | 582.607 |
| 4366000.0 | 561.572 |
| 4367000.0 | 523.968 |
| 4368000.0 | 508.16 |
| 4369000.0 | 516.314 |
| 4370000.0 | 539.784 |
| 4371000.0 | 537.507 |
| 4372000.0 | 530.5 |
| 4373000.0 | 490.653 |
| 4374000.0 | 495.857 |
| 4375000.0 | 597.028 |
| 4376000.0 | 736.159 |
| 4377000.0 | 648.45 |
| 4378000.0 | 478.625 |
| 4379000.0 | 429.015 |
| 4380000.0 | 468.598 |
| 4381000.0 | 444.121 |
| 4382000.0 | 465.98 |
| 4383000.0 | 525.462 |
| 4384000.0 | 486.605 |
| 4385000.0 | 433.864 |
| 4386000.0 | 445.463 |
| 4387000.0 | 531.656 |
| 4388000.0 | 457.352 |
| 4389000.0 | 478.735 |
| 4390000.0 | 482.493 |
| 4391000.0 | 441.874 |
| 4392000.0 | 444.486 |
| 4393000.0 | 445.356 |
| 4394000.0 | 489.187 |
| 4395000.0 | 477.715 |
| 4396000.0 | 352.032 |
| 4397000.0 | 323.003 |
| 4398000.0 | 396.676 |
| 4399000.0 | 378.07 |
| 4400000.0 | 424.554 |
| 4401000.0 | 518.597 |
| 4402000.0 | 567.306 |
| 4403000.0 | 508.579 |
| 4404000.0 | 454.022 |
| 4405000.0 | 486.5 |
| 4406000.0 | 463.974 |
| 4407000.0 | 484.298 |
| 4408000.0 | 490.803 |
| 4409000.0 | 494.383 |
| 4410000.0 | 448.409 |
| 4411000.0 | 441.65 |
| 4412000.0 | 470.772 |
| 4413000.0 | 487.098 |
| 4414000.0 | 462.444 |
| 4415000.0 | 469.436 |
| 4416000.0 | 496.387 |
| 4417000.0 | 464.763 |
| 4418000.0 | 521.518 |
| 4419000.0 | 693.095 |
| 4420000.0 | 533.406 |
| 4421000.0 | 540.254 |
| 4422000.0 | 450.108 |
| 4423000.0 | 525.918 |
| 4424000.0 | 444.514 |
| 4425000.0 | 558.813 |
| 4426000.0 | 594.877 |
| 4427000.0 | 561.72 |
| 4428000.0 | 519.289 |
| 4429000.0 | 448.466 |
| 4430000.0 | 442.701 |
| 4431000.0 | 424.352 |
| 4432000.0 | 430.439 |
| 4433000.0 | 428.411 |
| 4434000.0 | 477.554 |
| 4435000.0 | 474.849 |
| 4436000.0 | 506.575 |
| 4437000.0 | 495.982 |
| 4438000.0 | 564.875 |
| 4439000.0 | 474.666 |
| 4440000.0 | 465.982 |
| 4441000.0 | 505.046 |
| 4442000.0 | 523.023 |
| 4443000.0 | 480.125 |
| 4444000.0 | 425.201 |
| 4445000.0 | 466.528 |
| 4446000.0 | 479.569 |
| 4447000.0 | 527.883 |
| 4448000.0 | 468.917 |
| 4449000.0 | 492.275 |
| 4450000.0 | 495.665 |
| 4451000.0 | 488.18 |
| 4452000.0 | 455.847 |
| 4453000.0 | 512.466 |
| 4454000.0 | 490.94 |
| 4455000.0 | 517.46 |
| 4456000.0 | 447.02 |
| 4457000.0 | 513.377 |
| 4458000.0 | 481.361 |
| 4459000.0 | 510.722 |
| 4460000.0 | 466.965 |
| 4461000.0 | 430.056 |
| 4462000.0 | 514.707 |
| 4463000.0 | 514.446 |
| 4464000.0 | 487.028 |
| 4465000.0 | 485.583 |
| 4466000.0 | 508.035 |
| 4467000.0 | 442.957 |
| 4468000.0 | 492.524 |
| 4469000.0 | 433.059 |
| 4470000.0 | 234.282 |
| 4471000.0 | 235.132 |
| 4472000.0 | 255.818 |
| 4473000.0 | 241.315 |
| 4474000.0 | 218.036 |
| 4475000.0 | 236.283 |
| 4476000.0 | 220.031 |
| 4477000.0 | 256.945 |
| 4478000.0 | 348.73 |
| 4479000.0 | 324.895 |
| 4480000.0 | 335.061 |
| 4481000.0 | 319.045 |
| 4482000.0 | 365.235 |
| 4483000.0 | 304.594 |
| 4484000.0 | 305.113 |
| 4485000.0 | 320.307 |
| 4486000.0 | 309.608 |
| 4487000.0 | 265.716 |
| 4488000.0 | 253.107 |
| 4489000.0 | 248.795 |
| 4490000.0 | 241.502 |
| 4491000.0 | 253.372 |
| 4492000.0 | 259.111 |
| 4493000.0 | 272.96 |
| 4494000.0 | 289.964 |
| 4495000.0 | 287.545 |
| 4496000.0 | 290.774 |
| 4497000.0 | 292.021 |
| 4498000.0 | 290.728 |
| 4499000.0 | 288.721 |
| 4500000.0 | 338.934 |
| 4501000.0 | 333.067 |
| 4502000.0 | 266.975 |
| 4503000.0 | 299.29 |
| 4504000.0 | 254.49 |
| 4505000.0 | 251.383 |
| 4506000.0 | 242.855 |
| 4507000.0 | 231.017 |
| 4508000.0 | 226.718 |
| 4509000.0 | 207.83 |
| 4510000.0 | 229.026 |
| 4511000.0 | 235.471 |
| 4512000.0 | 219.675 |
| 4513000.0 | 230.681 |
| 4514000.0 | 239.806 |
| 4515000.0 | 232.229 |
| 4516000.0 | 266.049 |
| 4517000.0 | 229.852 |
| 4518000.0 | 245.908 |
| 4519000.0 | 236.887 |
| 4520000.0 | 197.141 |
| 4521000.0 | 212.378 |
| 4522000.0 | 227.25 |
| 4523000.0 | 257.03 |
| 4524000.0 | 237.278 |
| 4525000.0 | 239.751 |
| 4526000.0 | 235.648 |
| 4527000.0 | 226.91 |
| 4528000.0 | 255.638 |
| 4529000.0 | 264.844 |
| 4530000.0 | 264.62 |
| 4531000.0 | 281.38 |
| 4532000.0 | 237.706 |
| 4533000.0 | 238.278 |
| 4534000.0 | 231.438 |
| 4535000.0 | 254.196 |
| 4536000.0 | 245.22 |
| 4537000.0 | 245.925 |
| 4538000.0 | 273.496 |
| 4539000.0 | 276.248 |
| 4540000.0 | 246.865 |
| 4541000.0 | 250.939 |
| 4542000.0 | 273.897 |
| 4543000.0 | 250.348 |
| 4544000.0 | 239.138 |
| 4545000.0 | 239.719 |
| 4546000.0 | 233.36 |
| 4547000.0 | 226.421 |
| 4548000.0 | 229.976 |
| 4549000.0 | 285.609 |
| 4550000.0 | 280.365 |
| 4551000.0 | 242.184 |
| 4552000.0 | 272.341 |
| 4553000.0 | 239.726 |
| 4554000.0 | 224.749 |
| 4555000.0 | 235.228 |
| 4556000.0 | 195.38 |
| 4557000.0 | 241.652 |
| 4558000.0 | 252.657 |
| 4559000.0 | 274.826 |
| 4560000.0 | 301.893 |
| 4561000.0 | 318.115 |
| 4562000.0 | 351.66 |
| 4563000.0 | 277.007 |
| 4564000.0 | 243.997 |
| 4565000.0 | 302.502 |
| 4566000.0 | 271.07 |
| 4567000.0 | 279.08 |
| 4568000.0 | 242.95 |
| 4569000.0 | 234.017 |
| 4570000.0 | 235.914 |
| 4571000.0 | 263.002 |
| 4572000.0 | 271.451 |
| 4573000.0 | 295.877 |
| 4574000.0 | 257.702 |
| 4575000.0 | 252.406 |
| 4576000.0 | 248.555 |
| 4577000.0 | 251.479 |
| 4578000.0 | 277.999 |
| 4579000.0 | 274.66 |
| 4580000.0 | 245.718 |
| 4581000.0 | 258.613 |
| 4582000.0 | 263.753 |
| 4583000.0 | 258.301 |
| 4584000.0 | 259.688 |
| 4585000.0 | 215.268 |
| 4586000.0 | 257.476 |
| 4587000.0 | 239.734 |
| 4588000.0 | 257.617 |
| 4589000.0 | 249.77 |
| 4590000.0 | 240.227 |
| 4591000.0 | 225.349 |
| 4592000.0 | 221.23 |
| 4593000.0 | 217.815 |
| 4594000.0 | 264.211 |
| 4595000.0 | 250.713 |
| 4596000.0 | 257.486 |
| 4597000.0 | 273.876 |
| 4598000.0 | 257.838 |
| 4599000.0 | 218.569 |
| 4600000.0 | 221.837 |
| 4601000.0 | 259.167 |
| 4602000.0 | 223.644 |
| 4603000.0 | 215.644 |
| 4604000.0 | 232.138 |
| 4605000.0 | 255.841 |
| 4606000.0 | 261.197 |
| 4607000.0 | 213.656 |
| 4608000.0 | 234.822 |
| 4609000.0 | 230.233 |
| 4610000.0 | 259.504 |
| 4611000.0 | 246.114 |
| 4612000.0 | 218.83 |
| 4613000.0 | 240.071 |
| 4614000.0 | 241.68 |
| 4615000.0 | 266.349 |
| 4616000.0 | 228.485 |
| 4617000.0 | 251.536 |
| 4618000.0 | 250.154 |
| 4619000.0 | 229.702 |
| 4620000.0 | 233.906 |
| 4621000.0 | 223.135 |
| 4622000.0 | 255.979 |
| 4623000.0 | 240.739 |
| 4624000.0 | 256.228 |
| 4625000.0 | 247.082 |
| 4626000.0 | 279.389 |
| 4627000.0 | 240.862 |
| 4628000.0 | 224.947 |
| 4629000.0 | 218.031 |
| 4630000.0 | 257.261 |
| 4631000.0 | 258.057 |
| 4632000.0 | 268.716 |
| 4633000.0 | 252.151 |
| 4634000.0 | 242.312 |
| 4635000.0 | 256.457 |
| 4636000.0 | 218 |
| 4637000.0 | 235.803 |
| 4638000.0 | 236.052 |
| 4639000.0 | 228.094 |
| 4640000.0 | 241.878 |
| 4641000.0 | 233.001 |
| 4642000.0 | 252.562 |
| 4643000.0 | 249.212 |
| 4644000.0 | 264.49 |
| 4645000.0 | 231.245 |
| 4646000.0 | 266.025 |
| 4647000.0 | 249.299 |
| 4648000.0 | 217.202 |
| 4649000.0 | 239.596 |
| 4650000.0 | 230.582 |
| 4651000.0 | 222.329 |
| 4652000.0 | 255.248 |
| 4653000.0 | 281.724 |
| 4654000.0 | 287.614 |
| 4655000.0 | 325.879 |
| 4656000.0 | 256.236 |
| 4657000.0 | 252.155 |
| 4658000.0 | 208.92 |
| 4659000.0 | 275.489 |
| 4660000.0 | 256.01 |
| 4661000.0 | 279.127 |
| 4662000.0 | 266.639 |
| 4663000.0 | 267.271 |
| 4664000.0 | 257.217 |
| 4665000.0 | 233.159 |
| 4666000.0 | 274.85 |
| 4667000.0 | 308.776 |
| 4668000.0 | 299.683 |
| 4669000.0 | 270.813 |
| 4670000.0 | 247.063 |
| 4671000.0 | 239.959 |
| 4672000.0 | 232.795 |
| 4673000.0 | 246.474 |
| 4674000.0 | 215.685 |
| 4675000.0 | 265.636 |
| 4676000.0 | 202.328 |
| 4677000.0 | 274.423 |
| 4678000.0 | 279.399 |
| 4679000.0 | 249.419 |
| 4680000.0 | 266.701 |
| 4681000.0 | 240.808 |
| 4682000.0 | 240.902 |
| 4683000.0 | 216.999 |
| 4684000.0 | 261.477 |
| 4685000.0 | 227.33 |
| 4686000.0 | 218.704 |
| 4687000.0 | 224.38 |
| 4688000.0 | 225.693 |
| 4689000.0 | 208.184 |
| 4690000.0 | 210.753 |
| 4691000.0 | 245.134 |
| 4692000.0 | 266.877 |
| 4693000.0 | 253.143 |
| 4694000.0 | 239.436 |
| 4695000.0 | 269.208 |
| 4696000.0 | 264.181 |
| 4697000.0 | 210.943 |
| 4698000.0 | 227.383 |
| 4699000.0 | 236.185 |
| 4700000.0 | 261.791 |
| 4701000.0 | 214.716 |
| 4702000.0 | 216.218 |
| 4703000.0 | 257.956 |
| 4704000.0 | 255.056 |
| 4705000.0 | 231.344 |
| 4706000.0 | 260.968 |
| 4707000.0 | 223.29 |
| 4708000.0 | 245.324 |
| 4709000.0 | 224.417 |
| 4710000.0 | 232.999 |
| 4711000.0 | 294.444 |
| 4712000.0 | 261.937 |
| 4713000.0 | 253.176 |
| 4714000.0 | 242.896 |
| 4715000.0 | 294.404 |
| 4716000.0 | 281.784 |
| 4717000.0 | 280.405 |
| 4718000.0 | 221.389 |
| 4719000.0 | 251.779 |
| 4720000.0 | 239.424 |
| 4721000.0 | 222.405 |
| 4722000.0 | 239.789 |
| 4723000.0 | 262.153 |
| 4724000.0 | 246.264 |
| 4725000.0 | 243.106 |
| 4726000.0 | 259.304 |
| 4727000.0 | 242.58 |
| 4728000.0 | 248.956 |
| 4729000.0 | 269.493 |
| 4730000.0 | 270.959 |
| 4731000.0 | 232.759 |
| 4732000.0 | 294.373 |
| 4733000.0 | 259.946 |
| 4734000.0 | 274.339 |
| 4735000.0 | 271.916 |
| 4736000.0 | 280.201 |
| 4737000.0 | 275.602 |
| 4738000.0 | 242.304 |
| 4739000.0 | 294.065 |
| 4740000.0 | 259.829 |
| 4741000.0 | 242.388 |
| 4742000.0 | 270.544 |
| 4743000.0 | 259.724 |
| 4744000.0 | 249.35 |
| 4745000.0 | 343.839 |
| 4746000.0 | 291.336 |
| 4747000.0 | 237.123 |
| 4748000.0 | 248.709 |
| 4749000.0 | 252.604 |
| 4750000.0 | 261.532 |
| 4751000.0 | 284.85 |
| 4752000.0 | 286.66 |
| 4753000.0 | 326.188 |
| 4754000.0 | 297.276 |
| 4755000.0 | 251.131 |
| 4756000.0 | 256.016 |
| 4757000.0 | 285.052 |
| 4758000.0 | 303.741 |
| 4759000.0 | 341.621 |
| 4760000.0 | 287.8 |
| 4761000.0 | 273.938 |
| 4762000.0 | 239.164 |
| 4763000.0 | 248.193 |
| 4764000.0 | 304.069 |
| 4765000.0 | 227.892 |
| 4766000.0 | 238.144 |
| 4767000.0 | 218.617 |
| 4768000.0 | 230.446 |
| 4769000.0 | 264.49 |
| 4770000.0 | 259.09 |
| 4771000.0 | 241.215 |
| 4772000.0 | 232.296 |
| 4773000.0 | 220.27 |
| 4774000.0 | 270.055 |
| 4775000.0 | 243.132 |
| 4776000.0 | 227.784 |
| 4777000.0 | 324.237 |
| 4778000.0 | 259.761 |
| 4779000.0 | 340.313 |
| 4780000.0 | 214.607 |
| 4781000.0 | 243.006 |
| 4782000.0 | 225.586 |
| 4783000.0 | 231.338 |
| 4784000.0 | 230.178 |
| 4785000.0 | 275.606 |
| 4786000.0 | 268.649 |
| 4787000.0 | 230.7 |
| 4788000.0 | 257.571 |
| 4789000.0 | 220.331 |
| 4790000.0 | 228.403 |
| 4791000.0 | 247.567 |
| 4792000.0 | 219.368 |
| 4793000.0 | 228.466 |
| 4794000.0 | 227.324 |
| 4795000.0 | 249.205 |
| 4796000.0 | 267.316 |
| 4797000.0 | 261.839 |
| 4798000.0 | 245.545 |
| 4799000.0 | 239.438 |
| 4800000.0 | 239.752 |
| 4801000.0 | 218.573 |
| 4802000.0 | 227.495 |
| 4803000.0 | 264.069 |
| 4804000.0 | 224.175 |
| 4805000.0 | 234.894 |
| 4806000.0 | 287.753 |
| 4807000.0 | 286.184 |
| 4808000.0 | 246.978 |
| 4809000.0 | 241.899 |
| 4810000.0 | 274.144 |
| 4811000.0 | 291.978 |
| 4812000.0 | 232.249 |
| 4813000.0 | 215.764 |
| 4814000.0 | 249.116 |
| 4815000.0 | 243.183 |
| 4816000.0 | 273.807 |
| 4817000.0 | 247.465 |
| 4818000.0 | 225.275 |
| 4819000.0 | 190.176 |
| 4820000.0 | 230.91 |
| 4821000.0 | 238.222 |
| 4822000.0 | 243.064 |
| 4823000.0 | 241.654 |
| 4824000.0 | 238.338 |
| 4825000.0 | 249.322 |
| 4826000.0 | 242.844 |
| 4827000.0 | 276.112 |
| 4828000.0 | 265.146 |
| 4829000.0 | 268.938 |
| 4830000.0 | 284.049 |
| 4831000.0 | 274.951 |
| 4832000.0 | 273.812 |
| 4833000.0 | 254.011 |
| 4834000.0 | 210.157 |
| 4835000.0 | 223.076 |
| 4836000.0 | 230.69 |
| 4837000.0 | 233.761 |
| 4838000.0 | 240.082 |
| 4839000.0 | 221.835 |
| 4840000.0 | 219.995 |
| 4841000.0 | 236.225 |
| 4842000.0 | 252.722 |
| 4843000.0 | 249.424 |
| 4844000.0 | 254.349 |
| 4845000.0 | 233.962 |
| 4846000.0 | 212.716 |
| 4847000.0 | 241.208 |
| 4848000.0 | 222.271 |
| 4849000.0 | 259.653 |
| 4850000.0 | 271.07 |
| 4851000.0 | 292.159 |
| 4852000.0 | 263.994 |
| 4853000.0 | 270.585 |
| 4854000.0 | 290.849 |
| 4855000.0 | 310.812 |
| 4856000.0 | 253.57 |
| 4857000.0 | 306.846 |